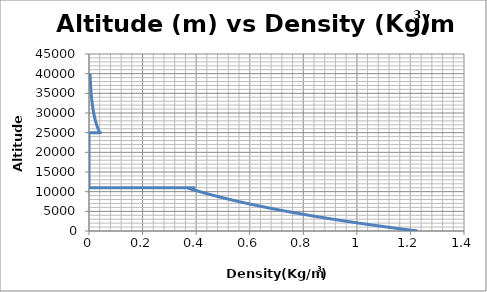
| Category | Series 0 |
|---|---|
| 1.22661378741097 | 0 |
| 1.225438372072172 | 10 |
| 1.2242638186305281 | 20 |
| 1.2230901266480423 | 30 |
| 1.221917295686837 | 40 |
| 1.2207453253091662 | 50 |
| 1.2195742150774005 | 60 |
| 1.218403964554039 | 70 |
| 1.2172345733017043 | 80 |
| 1.2160660408831405 | 90 |
| 1.214898366861219 | 100 |
| 1.213731550798931 | 110 |
| 1.2125655922593948 | 120 |
| 1.2114004908058522 | 130 |
| 1.2102362460016671 | 140 |
| 1.2090728574103307 | 150 |
| 1.2079103245954532 | 160 |
| 1.206748647120772 | 170 |
| 1.2055878245501488 | 180 |
| 1.2044278564475666 | 190 |
| 1.2032687423771353 | 200 |
| 1.2021104819030843 | 210 |
| 1.2009530745897703 | 220 |
| 1.1997965200016756 | 230 |
| 1.1986408177034003 | 240 |
| 1.197485967259674 | 250 |
| 1.196331968235345 | 260 |
| 1.1951788201953906 | 270 |
| 1.1940265227049098 | 280 |
| 1.1928750753291224 | 290 |
| 1.191724477633377 | 300 |
| 1.1905747291831406 | 310 |
| 1.1894258295440094 | 320 |
| 1.188277778281701 | 330 |
| 1.1871305749620542 | 340 |
| 1.1859842191510357 | 350 |
| 1.184838710414733 | 360 |
| 1.183694048319359 | 370 |
| 1.1825502324312502 | 380 |
| 1.1814072623168645 | 390 |
| 1.1802651375427866 | 400 |
| 1.1791238576757228 | 410 |
| 1.1779834222825052 | 420 |
| 1.176843830930086 | 430 |
| 1.1757050831855445 | 440 |
| 1.1745671786160825 | 450 |
| 1.1734301167890246 | 460 |
| 1.1722938972718204 | 470 |
| 1.1711585196320433 | 480 |
| 1.1700239834373865 | 490 |
| 1.168890288255674 | 500 |
| 1.1677574336548457 | 510 |
| 1.1666254192029712 | 520 |
| 1.1654942444682381 | 530 |
| 1.1643639090189637 | 540 |
| 1.1632344124235854 | 550 |
| 1.162105754250663 | 560 |
| 1.160977934068882 | 570 |
| 1.1598509514470514 | 580 |
| 1.158724805954103 | 590 |
| 1.1575994971590935 | 600 |
| 1.1564750246311999 | 610 |
| 1.1553513879397266 | 620 |
| 1.1542285866540987 | 630 |
| 1.1531066203438662 | 640 |
| 1.151985488578704 | 650 |
| 1.150865190928406 | 660 |
| 1.1497457269628943 | 670 |
| 1.1486270962522118 | 680 |
| 1.1475092983665258 | 690 |
| 1.1463923328761283 | 700 |
| 1.1452761993514313 | 710 |
| 1.1441608973629738 | 720 |
| 1.1430464264814162 | 730 |
| 1.141932786277543 | 740 |
| 1.1408199763222635 | 750 |
| 1.1397079961866061 | 760 |
| 1.138596845441729 | 770 |
| 1.1374865236589076 | 780 |
| 1.1363770304095446 | 790 |
| 1.1352683652651663 | 800 |
| 1.134160527797418 | 810 |
| 1.133053517578075 | 820 |
| 1.1319473341790296 | 830 |
| 1.1308419771723013 | 840 |
| 1.129737446130033 | 850 |
| 1.1286337406244882 | 860 |
| 1.1275308602280576 | 870 |
| 1.126428804513251 | 880 |
| 1.1253275730527044 | 890 |
| 1.124227165419177 | 900 |
| 1.12312758118555 | 910 |
| 1.12202881992483 | 920 |
| 1.1209308812101433 | 930 |
| 1.1198337646147427 | 940 |
| 1.1187374697120043 | 950 |
| 1.1176419960754254 | 960 |
| 1.1165473432786286 | 970 |
| 1.1154535108953576 | 980 |
| 1.1143604984994808 | 990 |
| 1.113268305664992 | 1000 |
| 1.1121769319660024 | 1010 |
| 1.1110863769767534 | 1020 |
| 1.1099966402716024 | 1030 |
| 1.1089077214250367 | 1040 |
| 1.1078196200116643 | 1050 |
| 1.1067323356062138 | 1060 |
| 1.1056458677835415 | 1070 |
| 1.1045602161186219 | 1080 |
| 1.1034753801865578 | 1090 |
| 1.102391359562573 | 1100 |
| 1.1013081538220122 | 1110 |
| 1.100225762540347 | 1120 |
| 1.0991441852931703 | 1130 |
| 1.0980634216561977 | 1140 |
| 1.0969834712052706 | 1150 |
| 1.0959043335163487 | 1160 |
| 1.09482600816552 | 1170 |
| 1.093748494728992 | 1180 |
| 1.092671792783097 | 1190 |
| 1.091595901904291 | 1200 |
| 1.0905208216691504 | 1210 |
| 1.089446551654378 | 1220 |
| 1.088373091436797 | 1230 |
| 1.0873004405933553 | 1240 |
| 1.0862285987011246 | 1250 |
| 1.085157565337296 | 1260 |
| 1.0840873400791886 | 1270 |
| 1.08301792250424 | 1280 |
| 1.081949312190014 | 1290 |
| 1.0808815087141963 | 1300 |
| 1.0798145116545952 | 1310 |
| 1.078748320589144 | 1320 |
| 1.0776829350958952 | 1330 |
| 1.076618354753028 | 1340 |
| 1.0755545791388434 | 1350 |
| 1.0744916078317643 | 1360 |
| 1.0734294404103393 | 1370 |
| 1.0723680764532355 | 1380 |
| 1.0713075155392473 | 1390 |
| 1.0702477572472908 | 1400 |
| 1.0691888011564035 | 1410 |
| 1.0681306468457488 | 1420 |
| 1.0670732938946088 | 1430 |
| 1.0660167418823927 | 1440 |
| 1.0649609903886303 | 1450 |
| 1.063906038992975 | 1460 |
| 1.0628518872752044 | 1470 |
| 1.061798534815215 | 1480 |
| 1.06074598119303 | 1490 |
| 1.0596942259887965 | 1500 |
| 1.058643268782779 | 1510 |
| 1.057593109155371 | 1520 |
| 1.056543746687083 | 1530 |
| 1.0554951809585542 | 1540 |
| 1.0544474115505438 | 1550 |
| 1.0534004380439317 | 1560 |
| 1.0523542600197255 | 1570 |
| 1.05130887705905 | 1580 |
| 1.0502642887431581 | 1590 |
| 1.0492204946534243 | 1600 |
| 1.0481774943713416 | 1610 |
| 1.0471352874785316 | 1620 |
| 1.0460938735567347 | 1630 |
| 1.0450532521878162 | 1640 |
| 1.0440134229537645 | 1650 |
| 1.0429743854366877 | 1660 |
| 1.0419361392188202 | 1670 |
| 1.0408986838825172 | 1680 |
| 1.039862019010258 | 1690 |
| 1.0388261441846425 | 1700 |
| 1.0377910589883954 | 1710 |
| 1.0367567630043633 | 1720 |
| 1.0357232558155152 | 1730 |
| 1.0346905370049437 | 1740 |
| 1.0336586061558646 | 1750 |
| 1.0326274628516126 | 1760 |
| 1.0315971066756513 | 1770 |
| 1.0305675372115608 | 1780 |
| 1.0295387540430492 | 1790 |
| 1.0285107567539418 | 1800 |
| 1.0274835449281916 | 1810 |
| 1.0264571181498725 | 1820 |
| 1.025431476003179 | 1830 |
| 1.0244066180724318 | 1840 |
| 1.0233825439420696 | 1850 |
| 1.022359253196659 | 1860 |
| 1.0213367454208873 | 1870 |
| 1.0203150201995614 | 1880 |
| 1.019294077117615 | 1890 |
| 1.0182739157601015 | 1900 |
| 1.0172545357121987 | 1910 |
| 1.016235936559207 | 1920 |
| 1.0152181178865471 | 1930 |
| 1.014201079279765 | 1940 |
| 1.0131848203245275 | 1950 |
| 1.0121693406066246 | 1960 |
| 1.0111546397119702 | 1970 |
| 1.010140717226597 | 1980 |
| 1.0091275727366642 | 1990 |
| 1.008115205828451 | 2000 |
| 1.0071036160883604 | 2010 |
| 1.0060928031029186 | 2020 |
| 1.005082766458771 | 2030 |
| 1.0040735057426897 | 2040 |
| 1.0030650205415659 | 2050 |
| 1.0020573104424153 | 2060 |
| 1.0010503750323758 | 2070 |
| 1.0000442138987065 | 2080 |
| 0.9990388266287914 | 2090 |
| 0.9980342128101332 | 2100 |
| 0.9970303720303607 | 2110 |
| 0.9960273038772235 | 2120 |
| 0.9950250079385935 | 2130 |
| 0.9940234838024666 | 2140 |
| 0.9930227310569578 | 2150 |
| 0.9920227492903075 | 2160 |
| 0.991023538090878 | 2170 |
| 0.9900250970471527 | 2180 |
| 0.9890274257477396 | 2190 |
| 0.9880305237813655 | 2200 |
| 0.9870343907368831 | 2210 |
| 0.9860390262032663 | 2220 |
| 0.9850444297696106 | 2230 |
| 0.9840506010251354 | 2240 |
| 0.98305753955918 | 2250 |
| 0.9820652449612072 | 2260 |
| 0.9810737168208052 | 2270 |
| 0.9800829547276788 | 2280 |
| 0.9790929582716599 | 2290 |
| 0.9781037270426983 | 2300 |
| 0.9771152606308712 | 2310 |
| 0.9761275586263755 | 2320 |
| 0.9751406206195284 | 2330 |
| 0.9741544462007731 | 2340 |
| 0.9731690349606718 | 2350 |
| 0.9721843864899115 | 2360 |
| 0.9712005003793011 | 2370 |
| 0.9702173762197691 | 2380 |
| 0.9692350136023695 | 2390 |
| 0.9682534121182766 | 2400 |
| 0.967272571358788 | 2410 |
| 0.9662924909153235 | 2420 |
| 0.9653131703794235 | 2430 |
| 0.9643346093427525 | 2440 |
| 0.9633568073970956 | 2450 |
| 0.9623797641343615 | 2460 |
| 0.9614034791465815 | 2470 |
| 0.9604279520259059 | 2480 |
| 0.959453182364611 | 2490 |
| 0.9584791697550923 | 2500 |
| 0.9575059137898696 | 2510 |
| 0.9565334140615845 | 2520 |
| 0.9555616701629976 | 2530 |
| 0.9545906816869977 | 2540 |
| 0.9536204482265893 | 2550 |
| 0.952650969374903 | 2560 |
| 0.9516822447251907 | 2570 |
| 0.9507142738708255 | 2580 |
| 0.9497470564053044 | 2590 |
| 0.9487805919222433 | 2600 |
| 0.9478148800153833 | 2610 |
| 0.9468499202785864 | 2620 |
| 0.9458857123058362 | 2630 |
| 0.9449222556912399 | 2640 |
| 0.9439595500290235 | 2650 |
| 0.9429975949135387 | 2660 |
| 0.9420363899392576 | 2670 |
| 0.9410759347007736 | 2680 |
| 0.9401162287928048 | 2690 |
| 0.939157271810187 | 2700 |
| 0.9381990633478812 | 2710 |
| 0.9372416030009703 | 2720 |
| 0.9362848903646576 | 2730 |
| 0.9353289250342703 | 2740 |
| 0.9343737066052552 | 2750 |
| 0.9334192346731823 | 2760 |
| 0.9324655088337457 | 2770 |
| 0.9315125286827571 | 2780 |
| 0.9305602938161541 | 2790 |
| 0.9296088038299919 | 2800 |
| 0.9286580583204523 | 2810 |
| 0.9277080568838377 | 2820 |
| 0.9267587991165693 | 2830 |
| 0.9258102846151944 | 2840 |
| 0.9248625129763791 | 2850 |
| 0.9239154837969139 | 2860 |
| 0.9229691966737084 | 2870 |
| 0.9220236512037961 | 2880 |
| 0.9210788469843326 | 2890 |
| 0.9201347836125932 | 2900 |
| 0.919191460685977 | 2910 |
| 0.9182488778020055 | 2920 |
| 0.9173070345583187 | 2930 |
| 0.9163659305526823 | 2940 |
| 0.9154255653829813 | 2950 |
| 0.9144859386472238 | 2960 |
| 0.9135470499435384 | 2970 |
| 0.9126088988701766 | 2980 |
| 0.9116714850255121 | 2990 |
| 0.9107348080080386 | 3000 |
| 0.9097988674163732 | 3010 |
| 0.9088636628492548 | 3020 |
| 0.9079291939055414 | 3030 |
| 0.9069954601842176 | 3040 |
| 0.9060624612843851 | 3050 |
| 0.9051301968052698 | 3060 |
| 0.904198666346217 | 3070 |
| 0.9032678695066974 | 3080 |
| 0.9023378058863019 | 3090 |
| 0.9014084750847402 | 3100 |
| 0.9004798767018477 | 3110 |
| 0.8995520103375797 | 3120 |
| 0.898624875592013 | 3130 |
| 0.8976984720653477 | 3140 |
| 0.8967727993579022 | 3150 |
| 0.8958478570701202 | 3160 |
| 0.8949236448025644 | 3170 |
| 0.8940001621559208 | 3180 |
| 0.8930774087309977 | 3190 |
| 0.8921553841287215 | 3200 |
| 0.8912340879501442 | 3210 |
| 0.8903135197964365 | 3220 |
| 0.8893936792688929 | 3230 |
| 0.888474565968929 | 3240 |
| 0.8875561794980797 | 3250 |
| 0.8866385194580046 | 3260 |
| 0.8857215854504831 | 3270 |
| 0.8848053770774166 | 3280 |
| 0.8838898939408293 | 3290 |
| 0.8829751356428631 | 3300 |
| 0.8820611017857872 | 3310 |
| 0.8811477919719871 | 3320 |
| 0.8802352058039722 | 3330 |
| 0.879323342884374 | 3340 |
| 0.8784122028159436 | 3350 |
| 0.8775017852015563 | 3360 |
| 0.8765920896442052 | 3370 |
| 0.875683115747008 | 3380 |
| 0.8747748631132032 | 3390 |
| 0.8738673313461498 | 3400 |
| 0.8729605200493299 | 3410 |
| 0.8720544288263444 | 3420 |
| 0.8711490572809181 | 3430 |
| 0.8702444050168968 | 3440 |
| 0.8693404716382467 | 3450 |
| 0.8684372567490575 | 3460 |
| 0.8675347599535369 | 3470 |
| 0.8666329808560169 | 3480 |
| 0.8657319190609507 | 3490 |
| 0.8648315741729115 | 3500 |
| 0.8639319457965953 | 3510 |
| 0.8630330335368175 | 3520 |
| 0.8621348369985167 | 3530 |
| 0.8612373557867539 | 3540 |
| 0.8603405895067079 | 3550 |
| 0.8594445377636826 | 3560 |
| 0.8585492001630992 | 3570 |
| 0.8576545763105045 | 3580 |
| 0.8567606658115648 | 3590 |
| 0.8558674682720662 | 3600 |
| 0.8549749832979187 | 3610 |
| 0.8540832104951512 | 3620 |
| 0.8531921494699162 | 3630 |
| 0.852301799828487 | 3640 |
| 0.8514121611772555 | 3650 |
| 0.8505232331227388 | 3660 |
| 0.8496350152715725 | 3670 |
| 0.8487475072305147 | 3680 |
| 0.8478607086064454 | 3690 |
| 0.8469746190063628 | 3700 |
| 0.8460892380373903 | 3710 |
| 0.8452045653067697 | 3720 |
| 0.8443206004218651 | 3730 |
| 0.8434373429901629 | 3740 |
| 0.8425547926192677 | 3750 |
| 0.8416729489169082 | 3760 |
| 0.8407918114909328 | 3770 |
| 0.8399113799493116 | 3780 |
| 0.8390316539001368 | 3790 |
| 0.8381526329516182 | 3800 |
| 0.8372743167120925 | 3810 |
| 0.8363967047900118 | 3820 |
| 0.8355197967939529 | 3830 |
| 0.8346435923326132 | 3840 |
| 0.8337680910148099 | 3850 |
| 0.8328932924494833 | 3860 |
| 0.8320191962456924 | 3870 |
| 0.8311458020126191 | 3880 |
| 0.8302731093595667 | 3890 |
| 0.8294011178959577 | 3900 |
| 0.8285298272313382 | 3910 |
| 0.827659236975372 | 3920 |
| 0.8267893467378474 | 3930 |
| 0.8259201561286723 | 3940 |
| 0.8250516647578751 | 3950 |
| 0.8241838722356066 | 3960 |
| 0.8233167781721367 | 3970 |
| 0.8224503821778582 | 3980 |
| 0.8215846838632843 | 3990 |
| 0.8207196828390487 | 4000 |
| 0.8198553787159079 | 4010 |
| 0.8189917711047359 | 4020 |
| 0.8181288596165304 | 4030 |
| 0.8172666438624117 | 4040 |
| 0.8164051234536162 | 4050 |
| 0.8155442980015057 | 4060 |
| 0.8146841671175593 | 4070 |
| 0.8138247304133807 | 4080 |
| 0.8129659875006933 | 4090 |
| 0.8121079379913392 | 4100 |
| 0.8112505814972844 | 4110 |
| 0.8103939176306139 | 4120 |
| 0.8095379460035356 | 4130 |
| 0.8086826662283756 | 4140 |
| 0.8078280779175827 | 4150 |
| 0.8069741806837272 | 4160 |
| 0.8061209741394981 | 4170 |
| 0.8052684578977073 | 4180 |
| 0.8044166315712871 | 4190 |
| 0.8035654947732892 | 4200 |
| 0.8027150471168882 | 4210 |
| 0.8018652882153784 | 4220 |
| 0.8010162176821759 | 4230 |
| 0.8001678351308154 | 4240 |
| 0.7993201401749547 | 4250 |
| 0.7984731324283721 | 4260 |
| 0.7976268115049658 | 4270 |
| 0.7967811770187553 | 4280 |
| 0.7959362285838819 | 4290 |
| 0.7950919658146045 | 4300 |
| 0.7942483883253075 | 4310 |
| 0.7934054957304916 | 4320 |
| 0.7925632876447815 | 4330 |
| 0.7917217636829192 | 4340 |
| 0.7908809234597717 | 4350 |
| 0.7900407665903247 | 4360 |
| 0.7892012926896829 | 4370 |
| 0.7883625013730743 | 4380 |
| 0.787524392255847 | 4390 |
| 0.786686964953469 | 4400 |
| 0.7858502190815303 | 4410 |
| 0.7850141542557393 | 4420 |
| 0.7841787700919277 | 4430 |
| 0.7833440662060465 | 4440 |
| 0.7825100422141672 | 4450 |
| 0.7816766977324838 | 4460 |
| 0.7808440323773077 | 4470 |
| 0.780012045765074 | 4480 |
| 0.7791807375123366 | 4490 |
| 0.778350107235771 | 4500 |
| 0.7775201545521736 | 4510 |
| 0.7766908790784592 | 4520 |
| 0.7758622804316664 | 4530 |
| 0.7750343582289517 | 4540 |
| 0.7742071120875936 | 4550 |
| 0.7733805416249921 | 4560 |
| 0.7725546464586641 | 4570 |
| 0.7717294262062523 | 4580 |
| 0.7709048804855151 | 4590 |
| 0.7700810089143342 | 4600 |
| 0.7692578111107117 | 4610 |
| 0.7684352866927691 | 4620 |
| 0.7676134352787499 | 4630 |
| 0.7667922564870163 | 4640 |
| 0.7659717499360521 | 4650 |
| 0.7651519152444624 | 4660 |
| 0.7643327520309711 | 4670 |
| 0.7635142599144242 | 4680 |
| 0.7626964385137861 | 4690 |
| 0.7618792874481438 | 4700 |
| 0.7610628063367041 | 4710 |
| 0.7602469947987937 | 4720 |
| 0.7594318524538611 | 4730 |
| 0.7586173789214729 | 4740 |
| 0.7578035738213175 | 4750 |
| 0.7569904367732057 | 4760 |
| 0.7561779673970647 | 4770 |
| 0.7553661653129459 | 4780 |
| 0.7545550301410177 | 4790 |
| 0.7537445615015709 | 4800 |
| 0.7529347590150182 | 4810 |
| 0.752125622301889 | 4820 |
| 0.7513171509828361 | 4830 |
| 0.7505093446786301 | 4840 |
| 0.7497022030101647 | 4850 |
| 0.7488957255984527 | 4860 |
| 0.7480899120646262 | 4870 |
| 0.7472847620299393 | 4880 |
| 0.7464802751157655 | 4890 |
| 0.7456764509435987 | 4900 |
| 0.7448732891350546 | 4910 |
| 0.7440707893118655 | 4920 |
| 0.7432689510958885 | 4930 |
| 0.742467774109098 | 4940 |
| 0.7416672579735891 | 4950 |
| 0.7408674023115793 | 4960 |
| 0.7400682067454026 | 4970 |
| 0.7392696708975165 | 4980 |
| 0.7384717943904976 | 4990 |
| 0.7376745768470427 | 5000 |
| 0.7368780178899687 | 5010 |
| 0.7360821171422127 | 5020 |
| 0.7352868742268325 | 5030 |
| 0.7344922887670063 | 5040 |
| 0.7336983603860315 | 5050 |
| 0.7329050887073266 | 5060 |
| 0.7321124733544285 | 5070 |
| 0.7313205139509982 | 5080 |
| 0.7305292101208127 | 5090 |
| 0.7297385614877714 | 5100 |
| 0.7289485676758926 | 5110 |
| 0.7281592283093161 | 5120 |
| 0.7273705430123015 | 5130 |
| 0.7265825114092281 | 5140 |
| 0.7257951331245948 | 5150 |
| 0.7250084077830214 | 5160 |
| 0.724222335009248 | 5170 |
| 0.7234369144281351 | 5180 |
| 0.7226521456646614 | 5190 |
| 0.7218680283439277 | 5200 |
| 0.7210845620911542 | 5210 |
| 0.7203017465316808 | 5220 |
| 0.7195195812909682 | 5230 |
| 0.7187380659945962 | 5240 |
| 0.7179572002682655 | 5250 |
| 0.7171769837377968 | 5260 |
| 0.7163974160291297 | 5270 |
| 0.7156184967683257 | 5280 |
| 0.7148402255815648 | 5290 |
| 0.714062602095147 | 5300 |
| 0.7132856259354938 | 5310 |
| 0.7125092967291448 | 5320 |
| 0.7117336141027614 | 5330 |
| 0.7109585776831229 | 5340 |
| 0.710184187097131 | 5350 |
| 0.7094104419718054 | 5360 |
| 0.7086373419342861 | 5370 |
| 0.7078648866118341 | 5380 |
| 0.7070930756318291 | 5390 |
| 0.7063219086217715 | 5400 |
| 0.7055513852092816 | 5410 |
| 0.7047815050220988 | 5420 |
| 0.704012267688083 | 5430 |
| 0.7032436728352148 | 5440 |
| 0.7024757200915934 | 5450 |
| 0.7017084090854383 | 5460 |
| 0.7009417394450889 | 5470 |
| 0.7001757107990045 | 5480 |
| 0.6994103227757641 | 5490 |
| 0.6986455750040673 | 5500 |
| 0.6978814671127329 | 5510 |
| 0.697117998730698 | 5520 |
| 0.6963551694870239 | 5530 |
| 0.6955929790108867 | 5540 |
| 0.6948314269315856 | 5550 |
| 0.6940705128785382 | 5560 |
| 0.6933102364812816 | 5570 |
| 0.6925505973694751 | 5580 |
| 0.6917915951728941 | 5590 |
| 0.691033229521437 | 5600 |
| 0.6902755000451197 | 5610 |
| 0.6895184063740798 | 5620 |
| 0.688761948138573 | 5630 |
| 0.6880061249689753 | 5640 |
| 0.6872509364957831 | 5650 |
| 0.6864963823496111 | 5660 |
| 0.6857424621611954 | 5670 |
| 0.6849891755613906 | 5680 |
| 0.6842365221811713 | 5690 |
| 0.6834845016516317 | 5700 |
| 0.6827331136039866 | 5710 |
| 0.6819823576695693 | 5720 |
| 0.6812322334798331 | 5730 |
| 0.680482740666351 | 5740 |
| 0.6797338788608154 | 5750 |
| 0.6789856476950397 | 5760 |
| 0.6782380468009552 | 5770 |
| 0.6774910758106137 | 5780 |
| 0.6767447343561859 | 5790 |
| 0.6759990220699631 | 5800 |
| 0.6752539385843561 | 5810 |
| 0.6745094835318949 | 5820 |
| 0.6737656565452287 | 5830 |
| 0.6730224572571263 | 5840 |
| 0.6722798853004777 | 5850 |
| 0.6715379403082908 | 5860 |
| 0.6707966219136934 | 5870 |
| 0.6700559297499328 | 5880 |
| 0.6693158634503761 | 5890 |
| 0.6685764226485104 | 5900 |
| 0.6678376069779411 | 5910 |
| 0.6670994160723946 | 5920 |
| 0.6663618495657149 | 5930 |
| 0.6656249070918672 | 5940 |
| 0.664888588284936 | 5950 |
| 0.6641528927791246 | 5960 |
| 0.6634178202087555 | 5970 |
| 0.6626833702082723 | 5980 |
| 0.6619495424122359 | 5990 |
| 0.6612163364553286 | 6000 |
| 0.6604837519723512 | 6010 |
| 0.6597517885982235 | 6020 |
| 0.6590204459679859 | 6030 |
| 0.6582897237167971 | 6040 |
| 0.6575596214799362 | 6050 |
| 0.6568301388928011 | 6060 |
| 0.6561012755909087 | 6070 |
| 0.6553730312098964 | 6080 |
| 0.65464540538552 | 6090 |
| 0.6539183977536558 | 6100 |
| 0.6531920079502976 | 6110 |
| 0.6524662356115607 | 6120 |
| 0.6517410803736784 | 6130 |
| 0.6510165418730033 | 6140 |
| 0.6502926197460085 | 6150 |
| 0.6495693136292847 | 6160 |
| 0.6488466231595439 | 6170 |
| 0.6481245479736157 | 6180 |
| 0.6474030877084497 | 6190 |
| 0.6466822420011147 | 6200 |
| 0.6459620104887998 | 6210 |
| 0.6452423928088115 | 6220 |
| 0.6445233885985768 | 6230 |
| 0.6438049974956412 | 6240 |
| 0.6430872191376706 | 6250 |
| 0.6423700531624493 | 6260 |
| 0.6416534992078814 | 6270 |
| 0.6409375569119891 | 6280 |
| 0.6402222259129144 | 6290 |
| 0.6395075058489198 | 6300 |
| 0.6387933963583854 | 6310 |
| 0.6380798970798109 | 6320 |
| 0.6373670076518153 | 6330 |
| 0.6366547277131359 | 6340 |
| 0.6359430569026319 | 6350 |
| 0.6352319948592785 | 6360 |
| 0.6345215412221719 | 6370 |
| 0.6338116956305263 | 6380 |
| 0.633102457723676 | 6390 |
| 0.6323938271410745 | 6400 |
| 0.631685803522294 | 6410 |
| 0.6309783865070254 | 6420 |
| 0.6302715757350789 | 6430 |
| 0.6295653708463844 | 6440 |
| 0.6288597714809911 | 6450 |
| 0.6281547772790664 | 6460 |
| 0.6274503878808964 | 6470 |
| 0.6267466029268881 | 6480 |
| 0.6260434220575655 | 6490 |
| 0.6253408449135733 | 6500 |
| 0.6246388711356746 | 6510 |
| 0.6239375003647506 | 6520 |
| 0.6232367322418035 | 6530 |
| 0.6225365664079525 | 6540 |
| 0.6218370025044379 | 6550 |
| 0.6211380401726164 | 6560 |
| 0.6204396790539667 | 6570 |
| 0.619741918790084 | 6580 |
| 0.6190447590226833 | 6590 |
| 0.6183481993935998 | 6600 |
| 0.6176522395447851 | 6610 |
| 0.6169568791183124 | 6620 |
| 0.6162621177563724 | 6630 |
| 0.6155679551012746 | 6640 |
| 0.6148743907954484 | 6650 |
| 0.6141814244814411 | 6660 |
| 0.6134890558019198 | 6670 |
| 0.6127972843996702 | 6680 |
| 0.6121061099175963 | 6690 |
| 0.6114155319987218 | 6700 |
| 0.610725550286189 | 6710 |
| 0.6100361644232597 | 6720 |
| 0.6093473740533129 | 6730 |
| 0.6086591788198478 | 6740 |
| 0.6079715783664823 | 6750 |
| 0.6072845723369531 | 6760 |
| 0.6065981603751156 | 6770 |
| 0.6059123421249442 | 6780 |
| 0.6052271172305309 | 6790 |
| 0.6045424853360897 | 6800 |
| 0.6038584460859494 | 6810 |
| 0.6031749991245606 | 6820 |
| 0.6024921440964913 | 6830 |
| 0.6018098806464276 | 6840 |
| 0.6011282084191772 | 6850 |
| 0.6004471270596633 | 6860 |
| 0.5997666362129299 | 6870 |
| 0.5990867355241387 | 6880 |
| 0.5984074246385711 | 6890 |
| 0.5977287032016262 | 6900 |
| 0.5970505708588225 | 6910 |
| 0.5963730272557971 | 6920 |
| 0.5956960720383051 | 6930 |
| 0.595019704852222 | 6940 |
| 0.5943439253435405 | 6950 |
| 0.5936687331583719 | 6960 |
| 0.592994127942947 | 6970 |
| 0.5923201093436155 | 6980 |
| 0.5916466770068447 | 6990 |
| 0.5909738305792209 | 7000 |
| 0.5903015697074494 | 7010 |
| 0.5896298940383536 | 7020 |
| 0.5889588032188768 | 7030 |
| 0.5882882968960793 | 7040 |
| 0.5876183747171408 | 7050 |
| 0.5869490363293587 | 7060 |
| 0.5862802813801513 | 7070 |
| 0.5856121095170533 | 7080 |
| 0.5849445203877186 | 7090 |
| 0.5842775136399195 | 7100 |
| 0.5836110889215468 | 7110 |
| 0.582945245880611 | 7120 |
| 0.5822799841652403 | 7130 |
| 0.5816153034236807 | 7140 |
| 0.5809512033042974 | 7150 |
| 0.5802876834555748 | 7160 |
| 0.579624743526115 | 7170 |
| 0.5789623831646389 | 7180 |
| 0.5783006020199855 | 7190 |
| 0.5776393997411122 | 7200 |
| 0.5769787759770957 | 7210 |
| 0.5763187303771309 | 7220 |
| 0.5756592625905311 | 7230 |
| 0.5750003722667271 | 7240 |
| 0.5743420590552698 | 7250 |
| 0.5736843226058271 | 7260 |
| 0.5730271625681868 | 7270 |
| 0.5723705785922537 | 7280 |
| 0.5717145703280512 | 7290 |
| 0.5710591374257223 | 7300 |
| 0.5704042795355271 | 7310 |
| 0.569749996307845 | 7320 |
| 0.5690962873931726 | 7330 |
| 0.5684431524421266 | 7340 |
| 0.5677905911054407 | 7350 |
| 0.5671386030339671 | 7360 |
| 0.5664871878786772 | 7370 |
| 0.5658363452906593 | 7380 |
| 0.5651860749211217 | 7390 |
| 0.5645363764213902 | 7400 |
| 0.5638872494429082 | 7410 |
| 0.5632386936372388 | 7420 |
| 0.5625907086560621 | 7430 |
| 0.5619432941511782 | 7440 |
| 0.5612964497745038 | 7450 |
| 0.5606501751780739 | 7460 |
| 0.5600044700140429 | 7470 |
| 0.5593593339346834 | 7480 |
| 0.5587147665923853 | 7490 |
| 0.5580707676396572 | 7500 |
| 0.5574273367291257 | 7510 |
| 0.5567844735135362 | 7520 |
| 0.5561421776457521 | 7530 |
| 0.5555004487787549 | 7540 |
| 0.5548592865656443 | 7550 |
| 0.554218690659637 | 7560 |
| 0.553578660714071 | 7570 |
| 0.5529391963823997 | 7580 |
| 0.5523002973181955 | 7590 |
| 0.5516619631751487 | 7600 |
| 0.5510241936070683 | 7610 |
| 0.5503869882678816 | 7620 |
| 0.5497503468116335 | 7630 |
| 0.5491142688924865 | 7640 |
| 0.5484787541647221 | 7650 |
| 0.5478438022827399 | 7660 |
| 0.5472094129010577 | 7670 |
| 0.5465755856743105 | 7680 |
| 0.5459423202572526 | 7690 |
| 0.5453096163047546 | 7700 |
| 0.5446774734718073 | 7710 |
| 0.5440458914135188 | 7720 |
| 0.5434148697851143 | 7730 |
| 0.5427844082419377 | 7740 |
| 0.542154506439452 | 7750 |
| 0.5415251640332359 | 7760 |
| 0.5408963806789887 | 7770 |
| 0.5402681560325259 | 7780 |
| 0.5396404897497812 | 7790 |
| 0.5390133814868074 | 7800 |
| 0.5383868308997742 | 7810 |
| 0.53776083764497 | 7820 |
| 0.5371354013788 | 7830 |
| 0.5365105217577889 | 7840 |
| 0.5358861984385788 | 7850 |
| 0.5352624310779288 | 7860 |
| 0.5346392193327173 | 7870 |
| 0.5340165628599398 | 7880 |
| 0.5333944613167101 | 7890 |
| 0.5327729143602601 | 7900 |
| 0.5321519216479382 | 7910 |
| 0.5315314828372131 | 7920 |
| 0.5309115975856692 | 7930 |
| 0.5302922655510102 | 7940 |
| 0.5296734863910568 | 7950 |
| 0.5290552597637477 | 7960 |
| 0.5284375853271401 | 7970 |
| 0.5278204627394085 | 7980 |
| 0.5272038916588454 | 7990 |
| 0.526587871743861 | 8000 |
| 0.5259724026529827 | 8010 |
| 0.5253574840448576 | 8020 |
| 0.5247431155782482 | 8030 |
| 0.5241292969120371 | 8040 |
| 0.5235160277052231 | 8050 |
| 0.5229033076169227 | 8060 |
| 0.522291136306372 | 8070 |
| 0.5216795134329227 | 8080 |
| 0.5210684386560456 | 8090 |
| 0.5204579116353285 | 8100 |
| 0.5198479320304771 | 8110 |
| 0.5192384995013161 | 8120 |
| 0.5186296137077852 | 8130 |
| 0.5180212743099446 | 8140 |
| 0.5174134809679704 | 8150 |
| 0.5168062333421575 | 8160 |
| 0.5161995310929179 | 8170 |
| 0.5155933738807807 | 8180 |
| 0.5149877613663945 | 8190 |
| 0.5143826932105237 | 8200 |
| 0.5137781690740514 | 8210 |
| 0.5131741886179781 | 8220 |
| 0.5125707515034215 | 8230 |
| 0.5119678573916172 | 8240 |
| 0.5113655059439195 | 8250 |
| 0.5107636968217987 | 8260 |
| 0.5101624296868434 | 8270 |
| 0.5095617042007594 | 8280 |
| 0.5089615200253708 | 8290 |
| 0.5083618768226192 | 8300 |
| 0.5077627742545634 | 8310 |
| 0.5071642119833795 | 8320 |
| 0.5065661896713611 | 8330 |
| 0.5059687069809212 | 8340 |
| 0.505371763574588 | 8350 |
| 0.5047753591150084 | 8360 |
| 0.5041794932649458 | 8370 |
| 0.5035841656872828 | 8380 |
| 0.5029893760450185 | 8390 |
| 0.5023951240012694 | 8400 |
| 0.5018014092192695 | 8410 |
| 0.5012082313623704 | 8420 |
| 0.5006155900940416 | 8430 |
| 0.5000234850778696 | 8440 |
| 0.49943191597755865 | 8450 |
| 0.49884088245692965 | 8460 |
| 0.4982503841799217 | 8470 |
| 0.4976604208105915 | 8480 |
| 0.49707099201311294 | 8490 |
| 0.4964820974517767 | 8500 |
| 0.4958937367909916 | 8510 |
| 0.49530590969528393 | 8520 |
| 0.4947186158292967 | 8530 |
| 0.49413185485779104 | 8540 |
| 0.49354562644564504 | 8550 |
| 0.4929599302578537 | 8560 |
| 0.49237476595953056 | 8570 |
| 0.4917901332159053 | 8580 |
| 0.4912060316923262 | 8590 |
| 0.4906224610542573 | 8600 |
| 0.49003942096728176 | 8610 |
| 0.4894569110970984 | 8620 |
| 0.4888749311095239 | 8630 |
| 0.488293480670493 | 8640 |
| 0.4877125594460567 | 8650 |
| 0.48713216710238405 | 8660 |
| 0.48655230330576077 | 8670 |
| 0.48597296772258997 | 8680 |
| 0.48539416001939256 | 8690 |
| 0.48481587986280555 | 8700 |
| 0.48423812691958495 | 8710 |
| 0.4836609008566024 | 8720 |
| 0.483084201340847 | 8730 |
| 0.48250802803942544 | 8740 |
| 0.4819323806195626 | 8750 |
| 0.4813572587485987 | 8760 |
| 0.48078266209399184 | 8770 |
| 0.4802085903233174 | 8780 |
| 0.4796350431042683 | 8790 |
| 0.4790620201046545 | 8800 |
| 0.47848952099240244 | 8810 |
| 0.4779175454355563 | 8820 |
| 0.4773460931022768 | 8830 |
| 0.47677516366084316 | 8840 |
| 0.47620475677965046 | 8850 |
| 0.47563487212721123 | 8860 |
| 0.47506550937215436 | 8870 |
| 0.4744966681832277 | 8880 |
| 0.47392834822929475 | 8890 |
| 0.47336054917933634 | 8900 |
| 0.47279327070245036 | 8910 |
| 0.4722265124678516 | 8920 |
| 0.4716602741448724 | 8930 |
| 0.4710945554029624 | 8940 |
| 0.47052935591168715 | 8950 |
| 0.46996467534073005 | 8960 |
| 0.46940051335989097 | 8970 |
| 0.46883686963908755 | 8980 |
| 0.4682737438483542 | 8990 |
| 0.4677111356578419 | 9000 |
| 0.46714904473781826 | 9010 |
| 0.46658747075866963 | 9020 |
| 0.4660264133908972 | 9030 |
| 0.46546587230512076 | 9040 |
| 0.46490584717207595 | 9050 |
| 0.4643463376626157 | 9060 |
| 0.46378734344771055 | 9070 |
| 0.4632288641984466 | 9080 |
| 0.4626708995860283 | 9090 |
| 0.46211344928177583 | 9100 |
| 0.4615565129571274 | 9110 |
| 0.46100009028363687 | 9120 |
| 0.46044418093297573 | 9130 |
| 0.45988878457693283 | 9140 |
| 0.4593339008874125 | 9150 |
| 0.458779529536437 | 9160 |
| 0.45822567019614563 | 9170 |
| 0.45767232253879325 | 9180 |
| 0.4571194862367526 | 9190 |
| 0.4565671609625136 | 9200 |
| 0.45601534638868185 | 9210 |
| 0.45546404218798037 | 9220 |
| 0.45491324803324873 | 9230 |
| 0.4543629635974437 | 9240 |
| 0.4538131885536388 | 9250 |
| 0.45326392257502385 | 9260 |
| 0.45271516533490586 | 9270 |
| 0.4521669165067079 | 9280 |
| 0.4516191757639711 | 9290 |
| 0.4510719427803519 | 9300 |
| 0.4505252172296249 | 9310 |
| 0.44997899878567993 | 9320 |
| 0.4494332871225244 | 9330 |
| 0.44888808191428303 | 9340 |
| 0.4483433828351952 | 9350 |
| 0.44779918955961934 | 9360 |
| 0.4472555017620289 | 9370 |
| 0.44671231911701476 | 9380 |
| 0.4461696412992848 | 9390 |
| 0.4456274679836621 | 9400 |
| 0.44508579884508814 | 9410 |
| 0.4445446335586195 | 9420 |
| 0.44400397179943085 | 9430 |
| 0.4434638132428124 | 9440 |
| 0.44292415756417114 | 9450 |
| 0.4423850044390311 | 9460 |
| 0.4418463535430325 | 9470 |
| 0.4413082045519327 | 9480 |
| 0.4407705571416047 | 9490 |
| 0.44023341098803864 | 9500 |
| 0.4396967657673414 | 9510 |
| 0.43916062115573634 | 9520 |
| 0.43862497682956314 | 9530 |
| 0.4380898324652779 | 9540 |
| 0.4375551877394532 | 9550 |
| 0.4370210423287787 | 9560 |
| 0.43648739591006047 | 9570 |
| 0.4359542481602207 | 9580 |
| 0.4354215987562978 | 9590 |
| 0.43488944737544716 | 9600 |
| 0.4343577936949413 | 9610 |
| 0.43382663739216815 | 9620 |
| 0.433295978144632 | 9630 |
| 0.43276581562995414 | 9640 |
| 0.4322361495258724 | 9650 |
| 0.43170697951024106 | 9660 |
| 0.43117830526103 | 9670 |
| 0.4306501264563267 | 9680 |
| 0.43012244277433365 | 9690 |
| 0.429595253893371 | 9700 |
| 0.4290685594918751 | 9710 |
| 0.42854235924839823 | 9720 |
| 0.42801665284160884 | 9730 |
| 0.4274914399502921 | 9740 |
| 0.42696672025335003 | 9750 |
| 0.42644249342980045 | 9760 |
| 0.42591875915877725 | 9770 |
| 0.425395517119531 | 9780 |
| 0.4248727669914291 | 9790 |
| 0.42435050845395406 | 9800 |
| 0.4238287411867057 | 9810 |
| 0.4233074648694001 | 9820 |
| 0.4227866791818684 | 9830 |
| 0.4222663838040598 | 9840 |
| 0.42174657841603863 | 9850 |
| 0.42122726269798594 | 9860 |
| 0.4207084363301984 | 9870 |
| 0.4201900989930898 | 9880 |
| 0.41967225036718975 | 9890 |
| 0.41915489013314355 | 9900 |
| 0.41863801797171385 | 9910 |
| 0.4181216335637786 | 9920 |
| 0.41760573659033234 | 9930 |
| 0.41709032673248586 | 9940 |
| 0.41657540367146534 | 9950 |
| 0.41606096708861445 | 9960 |
| 0.41554701666539223 | 9970 |
| 0.41503355208337406 | 9980 |
| 0.41452057302425127 | 9990 |
| 0.41400807916983107 | 10000 |
| 0.4134960702020376 | 10010 |
| 0.41298454580291116 | 10020 |
| 0.4124735056546071 | 10030 |
| 0.4119629494393976 | 10040 |
| 0.4114528768396707 | 10050 |
| 0.4109432875379308 | 10060 |
| 0.41043418121679853 | 10070 |
| 0.4099255575590102 | 10080 |
| 0.40941741624741795 | 10090 |
| 0.4089097569649901 | 10100 |
| 0.40840257939481206 | 10110 |
| 0.4078958832200841 | 10120 |
| 0.40738966812412264 | 10130 |
| 0.40688393379036003 | 10140 |
| 0.40637867990234555 | 10150 |
| 0.40587390614374363 | 10160 |
| 0.40536961219833517 | 10170 |
| 0.40486579775001635 | 10180 |
| 0.40436246248279967 | 10190 |
| 0.4038596060808141 | 10200 |
| 0.4033572282283044 | 10210 |
| 0.4028553286096305 | 10220 |
| 0.4023539069092692 | 10230 |
| 0.4018529628118123 | 10240 |
| 0.40135249600196865 | 10250 |
| 0.4008525061645624 | 10260 |
| 0.40035299298453353 | 10270 |
| 0.3998539561469376 | 10280 |
| 0.3993553953369473 | 10290 |
| 0.39885731023984994 | 10300 |
| 0.3983597005410488 | 10310 |
| 0.39786256592606417 | 10320 |
| 0.3973659060805306 | 10330 |
| 0.39686972069019993 | 10340 |
| 0.39637400944093887 | 10350 |
| 0.3958787720187301 | 10360 |
| 0.3953840081096724 | 10370 |
| 0.3948897173999805 | 10380 |
| 0.39439589957598475 | 10390 |
| 0.3939025543241308 | 10400 |
| 0.3934096813309805 | 10410 |
| 0.39291728028321155 | 10420 |
| 0.3924253508676178 | 10430 |
| 0.39193389277110807 | 10440 |
| 0.39144290568070716 | 10450 |
| 0.39095238928355525 | 10460 |
| 0.3904623432669099 | 10470 |
| 0.3899727673181427 | 10480 |
| 0.38948366112474103 | 10490 |
| 0.3889950243743089 | 10500 |
| 0.3885068567545646 | 10510 |
| 0.3880191579533444 | 10520 |
| 0.3875319276585982 | 10530 |
| 0.3870451655583922 | 10540 |
| 0.3865588713409079 | 10550 |
| 0.3860730446944437 | 10560 |
| 0.38558768530741255 | 10570 |
| 0.38510279286834304 | 10580 |
| 0.3846183670658799 | 10590 |
| 0.38413440758878264 | 10600 |
| 0.38365091412592756 | 10610 |
| 0.3831678863663059 | 10620 |
| 0.38268532399902455 | 10630 |
| 0.3822032267133054 | 10640 |
| 0.3817215941984873 | 10650 |
| 0.38124042614402315 | 10660 |
| 0.3807597222394828 | 10670 |
| 0.3802794821745503 | 10680 |
| 0.37979970563902615 | 10690 |
| 0.3793203923228263 | 10700 |
| 0.3788415419159818 | 10710 |
| 0.37836315410863974 | 10720 |
| 0.377885228591062 | 10730 |
| 0.3774077650536268 | 10740 |
| 0.3769307631868273 | 10750 |
| 0.3764542226812721 | 10760 |
| 0.3759781432276857 | 10770 |
| 0.37550252451690747 | 10780 |
| 0.37502736623989297 | 10790 |
| 0.37455266808771276 | 10800 |
| 0.3740784297515523 | 10810 |
| 0.37360465092271367 | 10820 |
| 0.37313133129261317 | 10830 |
| 0.3726584705527839 | 10840 |
| 0.37218606839487284 | 10850 |
| 0.3717141245106429 | 10860 |
| 0.37124263859197293 | 10870 |
| 0.37077161033085704 | 10880 |
| 0.3703010394194039 | 10890 |
| 0.3698309255498381 | 10900 |
| 0.36936126841449946 | 10910 |
| 0.3688920677058433 | 10920 |
| 0.3684233231164403 | 10930 |
| 0.3679550343389762 | 10940 |
| 0.36748720106625216 | 10950 |
| 0.3670198229911843 | 10960 |
| 0.3665528998068049 | 10970 |
| 0.366086431206261 | 10980 |
| 0.3656204168828147 | 10990 |
| 0.36515485652984336 | 11000 |
| 6.395055810185602e-08 | 11010 |
| 6.295437484060778e-08 | 11020 |
| 6.197370952196179e-08 | 11030 |
| 6.100832041675815e-08 | 11040 |
| 6.00579695613482e-08 | 11050 |
| 5.912242269893825e-08 | 11060 |
| 5.820144922184514e-08 | 11070 |
| 5.729482211465329e-08 | 11080 |
| 5.640231789825705e-08 | 11090 |
| 5.5523716574773037e-08 | 11100 |
| 5.465880157331253e-08 | 11110 |
| 5.3807359696597426e-08 | 11120 |
| 5.296918106840896e-08 | 11130 |
| 5.214405908185304e-08 | 11140 |
| 5.1331790348433295e-08 | 11150 |
| 5.053217464791736e-08 | 11160 |
| 4.974501487898244e-08 | 11170 |
| 4.89701170106316e-08 | 11180 |
| 4.8207290034365665e-08 | 11190 |
| 4.745634591710128e-08 | 11200 |
| 4.6717099554820685e-08 | 11210 |
| 4.5989368726944944e-08 | 11220 |
| 4.527297405141802e-08 | 11230 |
| 4.4567738940488966e-08 | 11240 |
| 4.387348955718441e-08 | 11250 |
| 4.319005477245909e-08 | 11260 |
| 4.2517266123012426e-08 | 11270 |
| 4.1854957769763786e-08 | 11280 |
| 4.120296645697367e-08 | 11290 |
| 4.0561131472002546e-08 | 11300 |
| 3.992929460569511e-08 | 11310 |
| 3.930730011338296e-08 | 11320 |
| 3.8694994676494717e-08 | 11330 |
| 3.809222736476291e-08 | 11340 |
| 3.749884959902083e-08 | 11350 |
| 3.6914715114578916e-08 | 11360 |
| 3.633967992517038e-08 | 11370 |
| 3.577360228745991e-08 | 11380 |
| 3.5216342666104326e-08 | 11390 |
| 3.4667763699358315e-08 | 11400 |
| 3.41277301652147e-08 | 11410 |
| 3.359610894807327e-08 | 11420 |
| 3.307276900592875e-08 | 11430 |
| 3.2557581338068956e-08 | 11440 |
| 3.205041895327703e-08 | 11450 |
| 3.1551156838529146e-08 | 11460 |
| 3.1059671928178676e-08 | 11470 |
| 3.057584307362161e-08 | 11480 |
| 3.009955101343378e-08 | 11490 |
| 2.963067834397396e-08 | 11500 |
| 2.9169109490443753e-08 | 11510 |
| 2.871473067839937e-08 | 11520 |
| 2.8267429905707037e-08 | 11530 |
| 2.7827096914934453e-08 | 11540 |
| 2.739362316617314e-08 | 11550 |
| 2.6966901810284222e-08 | 11560 |
| 2.6546827662560028e-08 | 11570 |
| 2.613329717679699e-08 | 11580 |
| 2.5726208419771822e-08 | 11590 |
| 2.5325461046115827e-08 | 11600 |
| 2.4930956273579733e-08 | 11610 |
| 2.454259685868464e-08 | 11620 |
| 2.416028707275222e-08 | 11630 |
| 2.3783932678307562e-08 | 11640 |
| 2.3413440905850343e-08 | 11650 |
| 2.30487204309879e-08 | 11660 |
| 2.2689681351923652e-08 | 11670 |
| 2.233623516729714e-08 | 11680 |
| 2.1988294754368677e-08 | 11690 |
| 2.1645774347544373e-08 | 11700 |
| 2.1308589517234823e-08 | 11710 |
| 2.097665714904393e-08 | 11720 |
| 2.064989542328177e-08 | 11730 |
| 2.0328223794796045e-08 | 11740 |
| 2.0011562973118308e-08 | 11750 |
| 1.9699834902919464e-08 | 11760 |
| 1.9392962744769086e-08 | 11770 |
| 1.909087085619518e-08 | 11780 |
| 1.8793484773038522e-08 | 11790 |
| 1.85007311910979e-08 | 11800 |
| 1.8212537948060582e-08 | 11810 |
| 1.7928834005714856e-08 | 11820 |
| 1.7649549432439666e-08 | 11830 |
| 1.7374615385966423e-08 | 11840 |
| 1.710396409640992e-08 | 11850 |
| 1.683752884956356e-08 | 11860 |
| 1.6575243970454293e-08 | 11870 |
| 1.6317044807154276e-08 | 11880 |
| 1.6062867714844384e-08 | 11890 |
| 1.5812650040126325e-08 | 11900 |
| 1.5566330105578496e-08 | 11910 |
| 1.5323847194553022e-08 | 11920 |
| 1.5085141536209553e-08 | 11930 |
| 1.4850154290781703e-08 | 11940 |
| 1.4618827535073516e-08 | 11950 |
| 1.4391104248181843e-08 | 11960 |
| 1.4166928297440644e-08 | 11970 |
| 1.3946244424584792e-08 | 11980 |
| 1.3728998232129051e-08 | 11990 |
| 1.35151361699596e-08 | 12000 |
| 1.3304605522133862e-08 | 12010 |
| 1.3097354393886464e-08 | 12020 |
| 1.2893331698837553e-08 | 12030 |
| 1.2692487146399982e-08 | 12040 |
| 1.2494771229383069e-08 | 12050 |
| 1.2300135211789452e-08 | 12060 |
| 1.2108531116801637e-08 | 12070 |
| 1.1919911714956129e-08 | 12080 |
| 1.1734230512501523e-08 | 12090 |
| 1.1551441739938171e-08 | 12100 |
| 1.1371500340735999e-08 | 12110 |
| 1.1194361960228404e-08 | 12120 |
| 1.1019982934679177e-08 | 12130 |
| 1.0848320280519362e-08 | 12140 |
| 1.0679331683752145e-08 | 12150 |
| 1.051297548952277e-08 | 12160 |
| 1.0349210691850595e-08 | 12170 |
| 1.0187996923521479e-08 | 12180 |
| 1.0029294446137376e-08 | 12190 |
| 9.873064140321178e-09 | 12200 |
| 9.719267496073746e-09 | 12210 |
| 9.567866603281512e-09 | 12220 |
| 9.418824142371915e-09 | 12230 |
| 9.272103375114106e-09 | 12240 |
| 9.127668135563261e-09 | 12250 |
| 8.985482821145952e-09 | 12260 |
| 8.845512383884085e-09 | 12270 |
| 8.707722321755896e-09 | 12280 |
| 8.572078670191284e-09 | 12290 |
| 8.438547993699849e-09 | 12300 |
| 8.30709737762903e-09 | 12310 |
| 8.177694420050887e-09 | 12320 |
| 8.050307223775278e-09 | 12330 |
| 7.924904388487184e-09 | 12340 |
| 7.801455003006771e-09 | 12350 |
| 7.679928637670027e-09 | 12360 |
| 7.560295336827826e-09 | 12370 |
| 7.4425256114621195e-09 | 12380 |
| 7.326590431916993e-09 | 12390 |
| 7.212461220743093e-09 | 12400 |
| 7.10010984565328e-09 | 12410 |
| 6.989508612588228e-09 | 12420 |
| 6.880630258890059e-09 | 12430 |
| 6.77344794658208e-09 | 12440 |
| 6.667935255753447e-09 | 12450 |
| 6.564066178046746e-09 | 12460 |
| 6.46181511024716e-09 | 12470 |
| 6.361156847971247e-09 | 12480 |
| 6.26206657945427e-09 | 12490 |
| 6.164519879434277e-09 | 12500 |
| 6.068492703131266e-09 | 12510 |
| 5.973961380320325e-09 | 12520 |
| 5.880902609497114e-09 | 12530 |
| 5.789293452134018e-09 | 12540 |
| 5.69911132702601e-09 | 12550 |
| 5.610334004724444e-09 | 12560 |
| 5.522939602057695e-09 | 12570 |
| 5.4369065767369376e-09 | 12580 |
| 5.352213722046143e-09 | 12590 |
| 5.268840161614783e-09 | 12600 |
| 5.186765344271798e-09 | 12610 |
| 5.105969038979882e-09 | 12620 |
| 5.026431329848698e-09 | 12630 |
| 4.948132611225594e-09 | 12640 |
| 4.871053582862973e-09 | 12650 |
| 4.795175245160859e-09 | 12660 |
| 4.720478894483642e-09 | 12670 |
| 4.646946118549626e-09 | 12680 |
| 4.574558791892548e-09 | 12690 |
| 4.503299071393784e-09 | 12700 |
| 4.4331493918840136e-09 | 12710 |
| 4.3640924618135395e-09 | 12720 |
| 4.296111258990057e-09 | 12730 |
| 4.229189026382665e-09 | 12740 |
| 4.163309267991411e-09 | 12750 |
| 4.098455744781075e-09 | 12760 |
| 4.034612470678388e-09 | 12770 |
| 3.971763708631453e-09 | 12780 |
| 3.909893966730686e-09 | 12790 |
| 3.848987994390178e-09 | 12800 |
| 3.789030778588418e-09 | 12810 |
| 3.730007540167696e-09 | 12820 |
| 3.671903730191157e-09 | 12830 |
| 3.614705026356477e-09 | 12840 |
| 3.558397329465544e-09 | 12850 |
| 3.502966759949043e-09 | 12860 |
| 3.4483996544452662e-09 | 12870 |
| 3.3946825624320842e-09 | 12880 |
| 3.3418022429114965e-09 | 12890 |
| 3.289745661145827e-09 | 12900 |
| 3.238499985444654e-09 | 12910 |
| 3.188052584001899e-09 | 12920 |
| 3.138391021782179e-09 | 12930 |
| 3.0895030574555686e-09 | 12940 |
| 3.0413766403802115e-09 | 12950 |
| 2.9939999076318824e-09 | 12960 |
| 2.947361181079872e-09 | 12970 |
| 2.9014489645083218e-09 | 12980 |
| 2.856251940782499e-09 | 12990 |
| 2.811758969059207e-09 | 13000 |
| 2.7679590820405603e-09 | 13010 |
| 2.7248414832706323e-09 | 13020 |
| 2.682395544474211e-09 | 13030 |
| 2.6406108029369216e-09 | 13040 |
| 2.5994769589262616e-09 | 13050 |
| 2.558983873152744e-09 | 13060 |
| 2.5191215642706526e-09 | 13070 |
| 2.479880206417632e-09 | 13080 |
| 2.4412501267926928e-09 | 13090 |
| 2.403221803271934e-09 | 13100 |
| 2.3657858620613404e-09 | 13110 |
| 2.32893307538621e-09 | 13120 |
| 2.292654359216582e-09 | 13130 |
| 2.2569407710280136e-09 | 13140 |
| 2.221783507597329e-09 | 13150 |
| 2.1871739028326507e-09 | 13160 |
| 2.153103425637283e-09 | 13170 |
| 2.1195636778067893e-09 | 13180 |
| 2.0865463919589025e-09 | 13190 |
| 2.054043429495678e-09 | 13200 |
| 2.0220467785973236e-09 | 13210 |
| 1.990548552247348e-09 | 13220 |
| 1.9595409862884713e-09 | 13230 |
| 1.9290164375087585e-09 | 13240 |
| 1.8989673817576298e-09 | 13250 |
| 1.8693864120911835e-09 | 13260 |
| 1.840266236946447e-09 | 13270 |
| 1.8115996783440025e-09 | 13280 |
| 1.7833796701186703e-09 | 13290 |
| 1.7555992561777537e-09 | 13300 |
| 1.7282515887863577e-09 | 13310 |
| 1.701329926879475e-09 | 13320 |
| 1.6748276344003664e-09 | 13330 |
| 1.6487381786647673e-09 | 13340 |
| 1.6230551287506384e-09 | 13350 |
| 1.597772153912964e-09 | 13360 |
| 1.5728830220232758e-09 | 13370 |
| 1.5483815980334315e-09 | 13380 |
| 1.5242618424633716e-09 | 13390 |
| 1.500517809912435e-09 | 13400 |
| 1.4771436475938127e-09 | 13410 |
| 1.4541335938918826e-09 | 13420 |
| 1.4314819769420153e-09 | 13430 |
| 1.409183213232454e-09 | 13440 |
| 1.3872318062280312e-09 | 13450 |
| 1.3656223450152856e-09 | 13460 |
| 1.3443495029687203e-09 | 13470 |
| 1.3234080364377875e-09 | 13480 |
| 1.3027927834543666e-09 | 13490 |
| 1.2824986624603818e-09 | 13500 |
| 1.262520671055192e-09 | 13510 |
| 1.2428538847625393e-09 | 13520 |
| 1.2234934558167042e-09 | 13530 |
| 1.204434611967526e-09 | 13540 |
| 1.1856726553040865e-09 | 13550 |
| 1.1672029610966895e-09 | 13560 |
| 1.1490209766569029e-09 | 13570 |
| 1.1311222202153197e-09 | 13580 |
| 1.1135022798168367e-09 | 13590 |
| 1.0961568122331407e-09 | 13600 |
| 1.0790815418921e-09 | 13610 |
| 1.06227225982387e-09 | 13620 |
| 1.045724822623413e-09 | 13630 |
| 1.029435151429148e-09 | 13640 |
| 1.0133992309175448e-09 | 13650 |
| 9.97613108313361e-10 | 13660 |
| 9.820728924153154e-10 | 13670 |
| 9.667747526369052e-10 | 13680 |
| 9.51714918062196e-10 | 13690 |
| 9.368896765163202e-10 | 13700 |
| 9.222953736504236e-10 | 13710 |
| 9.079284120408992e-10 | 13720 |
| 8.937852503026349e-10 | 13730 |
| 8.798624022160909e-10 | 13740 |
| 8.66156435867946e-10 | 13750 |
| 8.526639728051565e-10 | 13760 |
| 8.393816872021939e-10 | 13770 |
| 8.263063050412263e-10 | 13780 |
| 8.134346033050994e-10 | 13790 |
| 8.00763409182887e-10 | 13800 |
| 7.882895992877905e-10 | 13810 |
| 7.760100988872522e-10 | 13820 |
| 7.639218811450426e-10 | 13830 |
| 7.520219663751716e-10 | 13840 |
| 7.403074213073936e-10 | 13850 |
| 7.287753583641796e-10 | 13860 |
| 7.174229349489516e-10 | 13870 |
| 7.062473527453803e-10 | 13880 |
| 6.95245857027622e-10 | 13890 |
| 6.844157359813002e-10 | 13900 |
| 6.73754320035041e-10 | 13910 |
| 6.632589812024476e-10 | 13920 |
| 6.529271324343091e-10 | 13930 |
| 6.427562269809158e-10 | 13940 |
| 6.327437577642832e-10 | 13950 |
| 6.228872567601773e-10 | 13960 |
| 6.131842943897649e-10 | 13970 |
| 6.036324789207219e-10 | 13980 |
| 5.942294558776885e-10 | 13990 |
| 5.849729074619105e-10 | 14000 |
| 5.758605519798992e-10 | 14010 |
| 5.668901432810147e-10 | 14020 |
| 5.580594702037962e-10 | 14030 |
| 5.493663560309299e-10 | 14040 |
| 5.40808657952687e-10 | 14050 |
| 5.323842665387369e-10 | 14060 |
| 5.240911052181903e-10 | 14070 |
| 5.159271297677217e-10 | 14080 |
| 5.078903278076849e-10 | 14090 |
| 4.99978718306077e-10 | 14100 |
| 4.921903510902123e-10 | 14110 |
| 4.845233063660221e-10 | 14120 |
| 4.769756942448316e-10 | 14130 |
| 4.695456542775174e-10 | 14140 |
| 4.622313549959067e-10 | 14150 |
| 4.5503099346133484e-10 | 14160 |
| 4.479427948202338e-10 | 14170 |
| 4.409650118666303e-10 | 14180 |
| 4.340959246114728e-10 | 14190 |
| 4.2733383985866793e-10 | 14200 |
| 4.2067709078770585e-10 | 14210 |
| 4.141240365428039e-10 | 14220 |
| 4.0767306182844075e-10 | 14230 |
| 4.0132257651119954e-10 | 14240 |
| 3.950710152277997e-10 | 14250 |
| 3.889168369992464e-10 | 14260 |
| 3.8285852485099133e-10 | 14270 |
| 3.7689458543899755e-10 | 14280 |
| 3.7102354868164173e-10 | 14290 |
| 3.652439673973502e-10 | 14300 |
| 3.5955441694786805e-10 | 14310 |
| 3.539534948870978e-10 | 14320 |
| 3.4843982061540135e-10 | 14330 |
| 3.4301203503929315e-10 | 14340 |
| 3.3766880023642385e-10 | 14350 |
| 3.3240879912579197e-10 | 14360 |
| 3.2723073514309385e-10 | 14370 |
| 3.2213333192111994e-10 | 14380 |
| 3.171153329751401e-10 | 14390 |
| 3.1217550139318946e-10 | 14400 |
| 3.07312619531169e-10 | 14410 |
| 3.0252548871270726e-10 | 14420 |
| 2.9781292893368964e-10 | 14430 |
| 2.9317377857139794e-10 | 14440 |
| 2.8860689409816957e-10 | 14450 |
| 2.841111497995269e-10 | 14460 |
| 2.796854374966972e-10 | 14470 |
| 2.753286662734458e-10 | 14480 |
| 2.7103976220717393e-10 | 14490 |
| 2.668176681042049e-10 | 14500 |
| 2.626613432391851e-10 | 14510 |
| 2.5856976309855466e-10 | 14520 |
| 2.5454191912800735e-10 | 14530 |
| 2.5057681848389103e-10 | 14540 |
| 2.466734837884713e-10 | 14550 |
| 2.42830952889015e-10 | 14560 |
| 2.39048278620627e-10 | 14570 |
| 2.3532452857277403e-10 | 14580 |
| 2.3165878485945175e-10 | 14590 |
| 2.280501438929339e-10 | 14600 |
| 2.2449771616103668e-10 | 14610 |
| 2.2100062600786196e-10 | 14620 |
| 2.175580114179508e-10 | 14630 |
| 2.14169023803804e-10 | 14640 |
| 2.108328277967049e-10 | 14650 |
| 2.0754860104080716e-10 | 14660 |
| 2.043155339904308e-10 | 14670 |
| 2.0113282971050821e-10 | 14680 |
| 1.9799970368014632e-10 | 14690 |
| 1.9491538359924773e-10 | 14700 |
| 1.9187910919813867e-10 | 14710 |
| 1.8889013205016887e-10 | 14720 |
| 1.8594771538722681e-10 | 14730 |
| 1.8305113391813272e-10 | 14740 |
| 1.801996736498537e-10 | 14750 |
| 1.773926317115103e-10 | 14760 |
| 1.7462931618112388e-10 | 14770 |
| 1.7190904591505763e-10 | 14780 |
| 1.6923115038012e-10 | 14790 |
| 1.6659496948828307e-10 | 14800 |
| 1.6399985343397091e-10 | 14810 |
| 1.614451625338878e-10 | 14820 |
| 1.5893026706933846e-10 | 14830 |
| 1.564545471310076e-10 | 14840 |
| 1.5401739246615223e-10 | 14850 |
| 1.5161820232817863e-10 | 14860 |
| 1.4925638532856344e-10 | 14870 |
| 1.4693135929107554e-10 | 14880 |
| 1.4464255110827457e-10 | 14890 |
| 1.4238939660024395e-10 | 14900 |
| 1.4017134037552042e-10 | 14910 |
| 1.379878356941948e-10 | 14920 |
| 1.3583834433314223e-10 | 14930 |
| 1.3372233645335506e-10 | 14940 |
| 1.3163929046933666e-10 | 14950 |
| 1.295886929205353e-10 | 14960 |
| 1.2757003834477954e-10 | 14970 |
| 1.2558282915368185e-10 | 14980 |
| 1.2362657550998715e-10 | 14990 |
| 1.217007952068296e-10 | 15000 |
| 1.1980501354887255e-10 | 15010 |
| 1.1793876323529613e-10 | 15020 |
| 1.16101584244611e-10 | 15030 |
| 1.1429302372126663e-10 | 15040 |
| 1.1251263586402225e-10 | 15050 |
| 1.107599818160601e-10 | 15060 |
| 1.090346295568108e-10 | 15070 |
| 1.073361537954598e-10 | 15080 |
| 1.0566413586611705e-10 | 15090 |
| 1.0401816362461712e-10 | 15100 |
| 1.0239783134692911e-10 | 15110 |
| 1.0080273962914556e-10 | 15120 |
| 9.92324952890324e-11 | 15130 |
| 9.768671126911255e-11 | 15140 |
| 9.616500654125605e-11 | 15150 |
| 9.466700601275957e-11 | 15160 |
| 9.319234043388891e-11 | 15170 |
| 9.174064630685876e-11 | 15180 |
| 9.031156579623358e-11 | 15190 |
| 8.890474664072233e-11 | 15200 |
| 8.751984206634909e-11 | 15210 |
| 8.615651070097302e-11 | 15220 |
| 8.48144164901428e-11 | 15230 |
| 8.349322861426179e-11 | 15240 |
| 8.219262140704078e-11 | 15250 |
| 8.091227427522379e-11 | 15260 |
| 7.965187161956432e-11 | 15270 |
| 7.841110275702985e-11 | 15280 |
| 7.718966184422126e-11 | 15290 |
| 7.598724780198333e-11 | 15300 |
| 7.480356424119134e-11 | 15310 |
| 7.363831938969095e-11 | 15320 |
| 7.249122602037865e-11 | 15330 |
| 7.136200138040244e-11 | 15340 |
| 7.02503671214631e-11 | 15350 |
| 6.915604923120354e-11 | 15360 |
| 6.80787779656668e-11 | 15370 |
| 6.701828778280399e-11 | 15380 |
| 6.597431727702051e-11 | 15390 |
| 6.494660911474037e-11 | 15400 |
| 6.393490997097569e-11 | 15410 |
| 6.29389704668819e-11 | 15420 |
| 6.195854510828782e-11 | 15430 |
| 6.09933922251832e-11 | 15440 |
| 6.004327391214697e-11 | 15450 |
| 5.910795596970532e-11 | 15460 |
| 5.81872078466034e-11 | 15470 |
| 5.7280802582974244e-11 | 15480 |
| 5.638851675439515e-11 | 15490 |
| 5.551013041681425e-11 | 15500 |
| 5.464542705233621e-11 | 15510 |
| 5.3794193515850373e-11 | 15520 |
| 5.295621998249222e-11 | 15530 |
| 5.2131299895923127e-11 | 15540 |
| 5.131922991741403e-11 | 15550 |
| 5.0519809875724156e-11 | 15560 |
| 4.973284271776018e-11 | 15570 |
| 4.895813446000263e-11 | 15580 |
| 4.819549414069057e-11 | 15590 |
| 4.744473377275018e-11 | 15600 |
| 4.670566829745748e-11 | 15610 |
| 4.5978115538821305e-11 | 15620 |
| 4.5261896158678305e-11 | 15630 |
| 4.455683361248745e-11 | 15640 |
| 4.3862754105811746e-11 | 15650 |
| 4.31794865514792e-11 | 15660 |
| 4.2506862527411174e-11 | 15670 |
| 4.1844716235106214e-11 | 15680 |
| 4.119288445877219e-11 | 15690 |
| 4.0551206525094075e-11 | 15700 |
| 3.9919524263629395e-11 | 15710 |
| 3.9297681967819045e-11 | 15720 |
| 3.8685526356606926e-11 | 15730 |
| 3.808290653665728e-11 | 15740 |
| 3.748967396515938e-11 | 15750 |
| 3.6905682413212925e-11 | 15760 |
| 3.6330787929783696e-11 | 15770 |
| 3.5764848806219567e-11 | 15780 |
| 3.520772554132053e-11 | 15790 |
| 3.46592808069521e-11 | 15800 |
| 3.41193794141951e-11 | 15810 |
| 3.3587888280021484e-11 | 15820 |
| 3.306467639449048e-11 | 15830 |
| 3.254961478845552e-11 | 15840 |
| 3.204257650177342e-11 | 15850 |
| 3.154343655200954e-11 | 15860 |
| 3.1052071903630686e-11 | 15870 |
| 3.05683614376767e-11 | 15880 |
| 3.0092185921905734e-11 | 15890 |
| 2.9623427981403854e-11 | 15900 |
| 2.916197206965312e-11 | 15910 |
| 2.8707704440049322e-11 | 15920 |
| 2.8260513117864313e-11 | 15930 |
| 2.7820287872645084e-11 | 15940 |
| 2.7386920191041923e-11 | 15950 |
| 2.696030325006068e-11 | 15960 |
| 2.6540331890731746e-11 | 15970 |
| 2.6126902592188284e-11 | 15980 |
| 2.571991344614923e-11 | 15990 |
| 2.5319264131799257e-11 | 16000 |
| 2.492485589106049e-11 | 16010 |
| 2.4536591504248636e-11 | 16020 |
| 2.4154375266109057e-11 | 16030 |
| 2.3778112962226174e-11 | 16040 |
| 2.3407711845799543e-11 | 16050 |
| 2.304308061478249e-11 | 16060 |
| 2.2684129389376867e-11 | 16070 |
| 2.2330769689877623e-11 | 16080 |
| 2.1982914414863302e-11 | 16090 |
| 2.1640477819725857e-11 | 16100 |
| 2.1303375495535286e-11 | 16110 |
| 2.0971524348232838e-11 | 16120 |
| 2.0644842578148916e-11 | 16130 |
| 2.0323249659840122e-11 | 16140 |
| 2.0006666322239674e-11 | 16150 |
| 1.969501452911778e-11 | 16160 |
| 1.9388217459845944e-11 | 16170 |
| 1.908619949046134e-11 | 16180 |
| 1.878888617502546e-11 | 16190 |
| 1.8496204227273777e-11 | 16200 |
| 1.8208081502551224e-11 | 16210 |
| 1.7924446980028512e-11 | 16220 |
| 1.7645230745196035e-11 | 16230 |
| 1.7370363972630488e-11 | 16240 |
| 1.7099778909029338e-11 | 16250 |
| 1.6833408856510244e-11 | 16260 |
| 1.6571188156170237e-11 | 16270 |
| 1.631305217190134e-11 | 16280 |
| 1.605893727445775e-11 | 16290 |
| 1.5808780825771722e-11 | 16300 |
| 1.5562521163513745e-11 | 16310 |
| 1.532009758589277e-11 | 16320 |
| 1.508145033669366e-11 | 16330 |
| 1.4846520590547766e-11 | 16340 |
| 1.4615250438432422e-11 | 16350 |
| 1.4387582873396875e-11 | 16360 |
| 1.4163461776510251e-11 | 16370 |
| 1.3942831903028729e-11 | 16380 |
| 1.3725638868777653e-11 | 16390 |
| 1.3511829136746285e-11 | 16400 |
| 1.330135000389132e-11 | 16410 |
| 1.3094149588145566e-11 | 16420 |
| 1.2890176815629413e-11 | 16430 |
| 1.268938140806151e-11 | 16440 |
| 1.249171387036514e-11 | 16450 |
| 1.229712547846812e-11 | 16460 |
| 1.2105568267292451e-11 | 16470 |
| 1.1916995018931361e-11 | 16480 |
| 1.1731359251010038e-11 | 16490 |
| 1.1548615205228108e-11 | 16500 |
| 1.1368717836080542e-11 | 16510 |
| 1.1191622799753933e-11 | 16520 |
| 1.1017286443196083e-11 | 16530 |
| 1.0845665793355845e-11 | 16540 |
| 1.067671854659026e-11 | 16550 |
| 1.051040305823707e-11 | 16560 |
| 1.034667833234943e-11 | 16570 |
| 1.0185504011590771e-11 | 16580 |
| 1.0026840367286679e-11 | 16590 |
| 9.870648289632096e-12 | 16600 |
| 9.71688927805105e-12 | 16610 |
| 9.565525431706231e-12 | 16620 |
| 9.416519440156748e-12 | 16630 |
| 9.26983457416137e-12 | 16640 |
| 9.12543467662475e-12 | 16650 |
| 8.983284153685033e-12 | 16660 |
| 8.843347965940055e-12 | 16670 |
| 8.705591619810445e-12 | 16680 |
| 8.569981159036933e-12 | 16690 |
| 8.436483156310394e-12 | 16700 |
| 8.305064705032277e-12 | 16710 |
| 8.175693411203106e-12 | 16720 |
| 8.048337385437609e-12 | 16730 |
| 7.92296523510423e-12 | 16740 |
| 7.799546056586823e-12 | 16750 |
| 7.678049427667191e-12 | 16760 |
| 7.558445400026085e-12 | 16770 |
| 7.440704491861212e-12 | 16780 |
| 7.324797680619954e-12 | 16790 |
| 7.210696395845528e-12 | 16800 |
| 7.098372512134588e-12 | 16810 |
| 6.9877983422043e-12 | 16820 |
| 6.87894663006764e-12 | 16830 |
| 6.7717905443149986e-12 | 16840 |
| 6.666303671500229e-12 | 16850 |
| 6.562460009629952e-12 | 16860 |
| 6.4602339617541554e-12 | 16870 |
| 6.35960032965676e-12 | 16880 |
| 6.260534307644241e-12 | 16890 |
| 6.163011476431226e-12 | 16900 |
| 6.06700779712132e-12 | 16910 |
| 5.9724996052815054e-12 | 16920 |
| 5.8794636051090485e-12 | 16930 |
| 5.78787686368925e-12 | 16940 |
| 5.69771680534248e-12 | 16950 |
| 5.608961206059465e-12 | 16960 |
| 5.521588188023131e-12 | 16970 |
| 5.43557621421592e-12 | 16980 |
| 5.350904083110897e-12 | 16990 |
| 5.267550923445742e-12 | 17000 |
| 5.185496189078134e-12 | 17010 |
| 5.104719653921125e-12 | 17020 |
| 5.025201406957562e-12 | 17030 |
| 4.946921847332175e-12 | 17040 |
| 4.869861679519952e-12 | 17050 |
| 4.794001908569962e-12 | 17060 |
| 4.719323835423157e-12 | 17070 |
| 4.645809052303214e-12 | 17080 |
| 4.573439438179009e-12 | 17090 |
| 4.5021971542979205e-12 | 17100 |
| 4.432064639788719e-12 | 17110 |
| 4.363024607332794e-12 | 17120 |
| 4.2950600389029695e-12 | 17130 |
| 4.228154181568691e-12 | 17140 |
| 4.162290543366412e-12 | 17150 |
| 4.097452889234475e-12 | 17160 |
| 4.033625237011216e-12 | 17170 |
| 3.9707918534955e-12 | 17180 |
| 3.9089372505684715e-12 | 17190 |
| 3.848046181375865e-12 | 17200 |
| 3.7881036365697595e-12 | 17210 |
| 3.729094840608776e-12 | 17220 |
| 3.671005248116013e-12 | 17230 |
| 3.6138205402937273e-12 | 17240 |
| 3.55752662139374e-12 | 17250 |
| 3.5021096152429564e-12 | 17260 |
| 3.447555861822934e-12 | 17270 |
| 3.3938519139028022e-12 | 17280 |
| 3.3409845337245154e-12 | 17290 |
| 3.2889406897398447e-12 | 17300 |
| 3.2377075533982067e-12 | 17310 |
| 3.187272495984409e-12 | 17320 |
| 3.137623085505779e-12 | 17330 |
| 3.0887470836277685e-12 | 17340 |
| 3.040632442657195e-12 | 17350 |
| 2.9932673025725962e-12 | 17360 |
| 2.9466399881007638e-12 | 17370 |
| 2.9007390058388937e-12 | 17380 |
| 2.855553041421454e-12 | 17390 |
| 2.811070956731282e-12 | 17400 |
| 2.7672817871541235e-12 | 17410 |
| 2.7241747388758485e-12 | 17420 |
| 2.6817391862218676e-12 | 17430 |
| 2.6399646690379413e-12 | 17440 |
| 2.5988408901118373e-12 | 17450 |
| 2.5583577126350618e-12 | 17460 |
| 2.5185051577042176e-12 | 17470 |
| 2.479273401861279e-12 | 17480 |
| 2.440652774672102e-12 | 17490 |
| 2.40263375634274e-12 | 17500 |
| 2.365206975372887e-12 | 17510 |
| 2.3283632062457946e-12 | 17520 |
| 2.292093367154266e-12 | 17530 |
| 2.2563885177620147e-12 | 17540 |
| 2.2212398569999524e-12 | 17550 |
| 2.186638720896716e-12 | 17560 |
| 2.152576580443069e-12 | 17570 |
| 2.1190450394895648e-12 | 17580 |
| 2.0860358326768907e-12 | 17590 |
| 2.053540823398521e-12 | 17600 |
| 2.021552001795107e-12 | 17610 |
| 1.9900614827800397e-12 | 17620 |
| 1.9590615040958454e-12 | 17630 |
| 1.9285444244008146e-12 | 17640 |
| 1.8985027213854744e-12 | 17650 |
| 1.8689289899183344e-12 | 17660 |
| 1.8398159402205843e-12 | 17670 |
| 1.8111563960692128e-12 | 17680 |
| 1.7829432930280678e-12 | 17690 |
| 1.755169676706527e-12 | 17700 |
| 1.727828701045294e-12 | 17710 |
| 1.7009136266288403e-12 | 17720 |
| 1.674417819024198e-12 | 17730 |
| 1.6483347471455924e-12 | 17740 |
| 1.622657981644585e-12 | 17750 |
| 1.5973811933252368e-12 | 17760 |
| 1.5724981515840086e-12 | 17770 |
| 1.5480027228739667e-12 | 17780 |
| 1.5238888691928585e-12 | 17790 |
| 1.5001506465947927e-12 | 17800 |
| 1.4767822037251014e-12 | 17810 |
| 1.4537777803779784e-12 | 17820 |
| 1.4311317060766384e-12 | 17830 |
| 1.4088383986755604e-12 | 17840 |
| 1.3868923629845397e-12 | 17850 |
| 1.365288189414117e-12 | 17860 |
| 1.3440205526421595e-12 | 17870 |
| 1.3230842103012076e-12 | 17880 |
| 1.3024740016862286e-12 | 17890 |
| 1.282184846482544e-12 | 17900 |
| 1.2622117435135695e-12 | 17910 |
| 1.2425497695080234e-12 | 17920 |
| 1.2231940778863808e-12 | 17930 |
| 1.2041398975662094e-12 | 17940 |
| 1.185382531786136e-12 | 17950 |
| 1.1669173569480943e-12 | 17960 |
| 1.1487398214776421e-12 | 17970 |
| 1.1308454447020338e-12 | 17980 |
| 1.113229815745732e-12 | 17990 |
| 1.0958885924431607e-12 | 18000 |
| 1.0788175002683947e-12 | 18010 |
| 1.0620123312814865e-12 | 18020 |
| 1.0454689430912453e-12 | 18030 |
| 1.0291832578341508e-12 | 18040 |
| 1.0131512611691941e-12 | 18050 |
| 9.973690012883417e-13 | 18060 |
| 9.818325879424436e-13 | 18070 |
| 9.665381914823183e-13 | 18080 |
| 9.51482041914741e-13 | 18090 |
| 9.366604279731693e-13 | 18100 |
| 9.22069696202946e-13 | 18110 |
| 9.077062500607185e-13 | 18120 |
| 8.935665490279228e-13 | 18130 |
| 8.796471077380567e-13 | 18140 |
| 8.659444951175668e-13 | 18150 |
| 8.524553335400865e-13 | 18160 |
| 8.391762979938782e-13 | 18170 |
| 8.261041152622423e-13 | 18180 |
| 8.132355631166677e-13 | 18190 |
| 8.005674695225779e-13 | 18200 |
| 7.880967118574478e-13 | 18210 |
| 7.758202161410766e-13 | 18220 |
| 7.637349562778776e-13 | 18230 |
| 7.518379533109545e-13 | 18240 |
| 7.401262746878153e-13 | 18250 |
| 7.285970335374955e-13 | 18260 |
| 7.172473879589669e-13 | 18270 |
| 7.060745403206312e-13 | 18280 |
| 6.950757365707016e-13 | 18290 |
| 6.842482655583506e-13 | 18300 |
| 6.735894583654322e-13 | 18310 |
| 6.630966876485919e-13 | 18320 |
| 6.527673669916492e-13 | 18330 |
| 6.425989502680541e-13 | 18340 |
| 6.325889310132886e-13 | 18350 |
| 6.227348418070224e-13 | 18360 |
| 6.130342536649119e-13 | 18370 |
| 6.034847754398748e-13 | 18380 |
| 5.940840532326706e-13 | 18390 |
| 5.848297698116835e-13 | 18400 |
| 5.75719644041741e-13 | 18410 |
| 5.667514303218143e-13 | 18420 |
| 5.57922918031496e-13 | 18430 |
| 5.492319309860896e-13 | 18440 |
| 5.406763269001984e-13 | 18450 |
| 5.322539968596511e-13 | 18460 |
| 5.239628648016705e-13 | 18470 |
| 5.158008870031401e-13 | 18480 |
| 5.077660515768253e-13 | 18490 |
| 4.998563779754584e-13 | 18500 |
| 4.920699165035489e-13 | 18510 |
| 4.84404747836783e-13 | 18520 |
| 4.768589825489263e-13 | 18530 |
| 4.694307606460854e-13 | 18540 |
| 4.62118251108237e-13 | 18550 |
| 4.549196514378792e-13 | 18560 |
| 4.4783318721572976e-13 | 18570 |
| 4.4085711166334604e-13 | 18580 |
| 4.3398970521254263e-13 | 18590 |
| 4.272292750815311e-13 | 18600 |
| 4.205741548576627e-13 | 18610 |
| 4.1402270408665576e-13 | 18620 |
| 4.0757330786823886e-13 | 18630 |
| 4.012243764580824e-13 | 18640 |
| 3.949743448759404e-13 | 18650 |
| 3.888216725198818e-13 | 18660 |
| 3.8276484278654446e-13 | 18670 |
| 3.768023626973033e-13 | 18680 |
| 3.709327625302508e-13 | 18690 |
| 3.6515459545792323e-13 | 18700 |
| 3.594664371906619e-13 | 18710 |
| 3.5386688562553806e-13 | 18720 |
| 3.4835456050073367e-13 | 18730 |
| 3.4292810305531786e-13 | 18740 |
| 3.375861756943224e-13 | 18750 |
| 3.3232746165902375e-13 | 18760 |
| 3.271506647023726e-13 | 18770 |
| 3.220545087694786e-13 | 18780 |
| 3.1703773768306186e-13 | 18790 |
| 3.120991148338168e-13 | 18800 |
| 3.072374228755912e-13 | 18810 |
| 3.024514634253209e-13 | 18820 |
| 2.977400567676279e-13 | 18830 |
| 2.931020415640296e-13 | 18840 |
| 2.885362745666775e-13 | 18850 |
| 2.840416303365463e-13 | 18860 |
| 2.796170009660215e-13 | 18870 |
| 2.752612958058091e-13 | 18880 |
| 2.7097344119608953e-13 | 18890 |
| 2.6675238020187004e-13 | 18900 |
| 2.6259707235245324e-13 | 18910 |
| 2.585064933849704e-13 | 18920 |
| 2.544796349918995e-13 | 18930 |
| 2.505155045725259e-13 | 18940 |
| 2.4661312498827324e-13 | 18950 |
| 2.4277153432183856e-13 | 18960 |
| 2.389897856400871e-13 | 18970 |
| 2.352669467606405e-13 | 18980 |
| 2.3160210002209305e-13 | 18990 |
| 2.2799434205781657e-13 | 19000 |
| 2.244427835732831e-13 | 19010 |
| 2.2094654912686127e-13 | 19020 |
| 2.175047769140195e-13 | 19030 |
| 2.1411661855489823e-13 | 19040 |
| 2.1078123888519022e-13 | 19050 |
| 2.0749781575027232e-13 | 19060 |
| 2.0426553980255099e-13 | 19070 |
| 2.0108361430196364e-13 | 19080 |
| 1.979512549195824e-13 | 19090 |
| 1.9486768954428347e-13 | 19100 |
| 1.918321580924243e-13 | 19110 |
| 1.8884391232048938e-13 | 19120 |
| 1.8590221564064763e-13 | 19130 |
| 1.8300634293918958e-13 | 19140 |
| 1.8015558039779214e-13 | 19150 |
| 1.7734922531756193e-13 | 19160 |
| 1.7458658594582572e-13 | 19170 |
| 1.718669813056182e-13 | 19180 |
| 1.691897410278213e-13 | 19190 |
| 1.6655420518592369e-13 | 19200 |
| 1.639597241333509e-13 | 19210 |
| 1.614056583433333e-13 | 19220 |
| 1.5889137825126205e-13 | 19230 |
| 1.5641626409950653e-13 | 19240 |
| 1.5397970578464873e-13 | 19250 |
| 1.5158110270709237e-13 | 19260 |
| 1.4921986362301983e-13 | 19270 |
| 1.4689540649865508e-13 | 19280 |
| 1.446071583667919e-13 | 19290 |
| 1.4235455518556246e-13 | 19300 |
| 1.4013704169940296e-13 | 19310 |
| 1.379540713021875e-13 | 19320 |
| 1.3580510590248971e-13 | 19330 |
| 1.336896157909472e-13 | 19340 |
| 1.3160707950969225e-13 | 19350 |
| 1.2955698372381224e-13 | 19360 |
| 1.275388230948165e-13 | 19370 |
| 1.2555210015607423e-13 | 19380 |
| 1.235963251901888e-13 | 19390 |
| 1.216710161082864e-13 | 19400 |
| 1.197756983311829e-13 | 19410 |
| 1.17909904672404e-13 | 19420 |
| 1.1607317522302352e-13 | 19430 |
| 1.1426505723829946e-13 | 19440 |
| 1.1248510502607574e-13 | 19450 |
| 1.1073287983691907e-13 | 19460 |
| 1.0900794975597037e-13 | 19470 |
| 1.0730988959648117e-13 | 19480 |
| 1.0563828079500484e-13 | 19490 |
| 1.0399271130822432e-13 | 19500 |
| 1.0237277551138464e-13 | 19510 |
| 1.0077807409831002e-13 | 19520 |
| 9.920821398297457e-14 | 19530 |
| 9.766280820260963e-14 | 19540 |
| 9.614147582232054e-14 | 19550 |
| 9.464384184118574e-14 | 19560 |
| 9.316953709982215e-14 | 19570 |
| 9.171819818939013e-14 | 19580 |
| 9.028946736201297e-14 | 19590 |
| 8.888299244259509e-14 | 19600 |
| 8.749842674201217e-14 | 19610 |
| 8.613542897165499e-14 | 19620 |
| 8.479366315930176e-14 | 19630 |
| 8.347279856630356e-14 | 19640 |
| 8.217250960605968e-14 | 19650 |
| 8.089247576376049e-14 | 19660 |
| 7.963238151738287e-14 | 19670 |
| 7.83919162599166e-14 | 19680 |
| 7.717077422279937e-14 | 19690 |
| 7.596865440054765e-14 | 19700 |
| 7.478526047655968e-14 | 19710 |
| 7.362030075007595e-14 | 19720 |
| 7.247348806427483e-14 | 19730 |
| 7.134453973549069e-14 | 19740 |
| 7.023317748353445e-14 | 19750 |
| 6.913912736309731e-14 | 19760 |
| 6.806211969622554e-14 | 19770 |
| 6.70018890058468e-14 | 19780 |
| 6.595817395032981e-14 | 19790 |
| 6.493071725906607e-14 | 19800 |
| 6.391926566905335e-14 | 19810 |
| 6.292356986246858e-14 | 19820 |
| 6.194338440521076e-14 | 19830 |
| 6.09784676864035e-14 | 19840 |
| 6.002858185883973e-14 | 19850 |
| 5.909349278035214e-14 | 19860 |
| 5.817296995609929e-14 | 19870 |
| 5.726678648174928e-14 | 19880 |
| 5.637471898754979e-14 | 19890 |
| 5.549654758326729e-14 | 19900 |
| 5.4632055803985816e-14 | 19910 |
| 5.3781030556750054e-14 | 19920 |
| 5.294326206803774e-14 | 19930 |
| 5.211854383205213e-14 | 19940 |
| 5.130667255981997e-14 | 19950 |
| 5.050744812908054e-14 | 19960 |
| 4.972067353495732e-14 | 19970 |
| 4.894615484139686e-14 | 19980 |
| 4.818370113336522e-14 | 19990 |
| 4.743312446978734e-14 | 20000 |
| 4.6694239837220945e-14 | 20010 |
| 4.596686510425222e-14 | 20020 |
| 4.525082097660024e-14 | 20030 |
| 4.454593095292239e-14 | 20040 |
| 4.385202128130808e-14 | 20050 |
| 4.316892091644884e-14 | 20060 |
| 4.249646147747708e-14 | 20070 |
| 4.183447720646078e-14 | 20080 |
| 4.118280492754555e-14 | 20090 |
| 4.0541284006731696e-14 | 20100 |
| 3.990975631227918e-14 | 20110 |
| 3.928806617572938e-14 | 20120 |
| 3.867606035353267e-14 | 20130 |
| 3.807358798927511e-14 | 20140 |
| 3.7480500576493516e-14 | 20150 |
| 3.689665192206848e-14 | 20160 |
| 3.632189811018905e-14 | 20170 |
| 3.5756097466877955e-14 | 20180 |
| 3.519911052507014e-14 | 20190 |
| 3.465079999023408e-14 | 20200 |
| 3.411103070652975e-14 | 20210 |
| 3.357966962349371e-14 | 20220 |
| 3.305658576324212e-14 | 20230 |
| 3.25416501881857e-14 | 20240 |
| 3.20347359692476e-14 | 20250 |
| 3.153571815457527e-14 | 20260 |
| 3.1044473738740996e-14 | 20270 |
| 3.056088163242134e-14 | 20280 |
| 3.0084822632549744e-14 | 20290 |
| 2.961617939293287e-14 | 20300 |
| 2.9154836395325666e-14 | 20310 |
| 2.8700679920957e-14 | 20320 |
| 2.8253598022497942e-14 | 20330 |
| 2.7813480496467606e-14 | 20340 |
| 2.7380218856068804e-14 | 20350 |
| 2.695370630444604e-14 | 20360 |
| 2.653383770836096e-14 | 20370 |
| 2.6120509572277358e-14 | 20380 |
| 2.5713620012850333e-14 | 20390 |
| 2.531306873381241e-14 | 20400 |
| 2.4918757001250407e-14 | 20410 |
| 2.453058761926927e-14 | 20420 |
| 2.4148464906032314e-14 | 20430 |
| 2.3772294670177384e-14 | 20440 |
| 2.3401984187598607e-14 | 20450 |
| 2.3037442178589853e-14 | 20460 |
| 2.2678578785345774e-14 | 20470 |
| 2.2325305549811733e-14 | 20480 |
| 2.197753539187891e-14 | 20490 |
| 2.1635182587920428e-14 | 20500 |
| 2.1298162749660407e-14 | 20510 |
| 2.0966392803372223e-14 | 20520 |
| 2.0639790969402172e-14 | 20530 |
| 2.0318276742010702e-14 | 20540 |
| 2.0001770869527745e-14 | 20550 |
| 1.9690195334818413e-14 | 20560 |
| 1.9383473336051746e-14 | 20570 |
| 1.908152926776901e-14 | 20580 |
| 1.8784288702248163e-14 | 20590 |
| 1.849167837115736e-14 | 20600 |
| 1.8203626147494312e-14 | 20610 |
| 1.7920061027808205e-14 | 20620 |
| 1.7640913114696703e-14 | 20630 |
| 1.7366113599577456e-14 | 20640 |
| 1.709559474572676e-14 | 20650 |
| 1.6829289871582404e-14 | 20660 |
| 1.656713333430774e-14 | 20670 |
| 1.6309060513610682e-14 | 20680 |
| 1.6055007795814748e-14 | 20690 |
| 1.5804912558179342e-14 | 20700 |
| 1.5558713153463186e-14 | 20710 |
| 1.5316348894728234e-14 | 20720 |
| 1.5077760040381348e-14 | 20730 |
| 1.4842887779447902e-14 | 20740 |
| 1.46116742170749e-14 | 20750 |
| 1.4384062360260786e-14 | 20760 |
| 1.4159996103806646e-14 | 20770 |
| 1.3939420216486237e-14 | 20780 |
| 1.3722280327432389e-14 | 20790 |
| 1.3508522912734534e-14 | 20800 |
| 1.3298095282245041e-14 | 20810 |
| 1.3090945566592035e-14 | 20820 |
| 1.2887022704393086e-14 | 20830 |
| 1.2686276429669495e-14 | 20840 |
| 1.2488657259455684e-14 | 20850 |
| 1.229411648160163e-14 | 20860 |
| 1.2102606142766106e-14 | 20870 |
| 1.1914079036596126e-14 | 20880 |
| 1.1728488692090578e-14 | 20890 |
| 1.1545789362145862e-14 | 20900 |
| 1.1365936012279186e-14 | 20910 |
| 1.1188884309527551e-14 | 20920 |
| 1.1014590611520393e-14 | 20930 |
| 1.0843011955721687e-14 | 20940 |
| 1.0674106048839681e-14 | 20950 |
| 1.0507831256402275e-14 | 20960 |
| 1.0344146592494073e-14 | 20970 |
| 1.0183011709653368e-14 | 20980 |
| 1.0024386888927104e-14 | 20990 |
| 9.868233030080155e-15 | 21000 |
| 9.71451164195708e-15 | 21010 |
| 9.563184832994745e-15 | 21020 |
| 9.41421530188168e-15 | 21030 |
| 9.267566328363977e-15 | 21040 |
| 9.12320176419371e-15 | 21050 |
| 8.98108602421839e-15 | 21060 |
| 8.84118407760978e-15 | 21070 |
| 8.703461439228777e-15 | 21080 |
| 8.567884161124814e-15 | 21090 |
| 8.434418824168221e-15 | 21100 |
| 8.3030325298124e-15 | 21110 |
| 8.173692891984305e-15 | 21120 |
| 8.046368029101802e-15 | 21130 |
| 7.92102655621483e-15 | 21140 |
| 7.797637577269003e-15 | 21150 |
| 7.676170677490217e-15 | 21160 |
| 7.556595915887397e-15 | 21170 |
| 7.43888381787202e-15 | 21180 |
| 7.32300536799316e-15 | 21190 |
| 7.20893200278489e-15 | 21200 |
| 7.096635603725904e-15 | 21210 |
| 6.986088490308273e-15 | 21220 |
| 6.877263413214192e-15 | 21230 |
| 6.770133547599461e-15 | 21240 |
| 6.664672486481141e-15 | 21250 |
| 6.560854234228212e-15 | 21260 |
| 6.458653200154077e-15 | 21270 |
| 6.358044192208435e-15 | 21280 |
| 6.2590024107674265e-15 | 21290 |
| 6.161503442520927e-15 | 21300 |
| 6.065523254454645e-15 | 21310 |
| 5.971038187925972e-15 | 21320 |
| 5.878024952832515e-15 | 21330 |
| 5.786460621871054e-15 | 21340 |
| 5.696322624885963e-15 | 21350 |
| 5.607588743306027e-15 | 21360 |
| 5.5202371046675406e-15 | 21370 |
| 5.43424617722274e-15 | 21380 |
| 5.349594764632615e-15 | 21390 |
| 5.266262000741795e-15 | 21400 |
| 5.184227344435421e-15 | 21410 |
| 5.103470574575742e-15 | 21420 |
| 5.0239717850176e-15 | 21430 |
| 4.945711379701879e-15 | 21440 |
| 4.86867006782506e-15 | 21450 |
| 4.792828859084041e-15 | 21460 |
| 4.7181690589953155e-15 | 21470 |
| 4.6446722642867816e-15 | 21480 |
| 4.5723203583613024e-15 | 21490 |
| 4.501095506831322e-15 | 21500 |
| 4.430980153122583e-15 | 21510 |
| 4.3619570141464794e-15 | 21520 |
| 4.294009076040043e-15 | 21530 |
| 4.227119589972008e-15 | 21540 |
| 4.161272068014223e-15 | 21550 |
| 4.096450279077635e-15 | 21560 |
| 4.032638244911314e-15 | 21570 |
| 3.9698202361638115e-15 | 21580 |
| 3.907980768506151e-15 | 21590 |
| 3.84710459881479e-15 | 21600 |
| 3.7871767214144654e-15 | 21610 |
| 3.7281823643792794e-15 | 21620 |
| 3.670106985891415e-15 | 21630 |
| 3.612936270656812e-15 | 21640 |
| 3.556656126376431e-15 | 21650 |
| 3.501252680272506e-15 | 21660 |
| 3.446712275669114e-15 | 21670 |
| 3.393021468625803e-15 | 21680 |
| 3.340167024623651e-15 | 21690 |
| 3.2881359153031712e-15 | 21700 |
| 3.236915315252809e-15 | 21710 |
| 3.1864925988474724e-15 | 21720 |
| 3.1368553371365212e-15 | 21730 |
| 3.0879912947800175e-15 | 21740 |
| 3.0398884270327104e-15 | 21750 |
| 2.9925348767751986e-15 | 21760 |
| 2.9459189715911417e-15 | 21770 |
| 2.900029220890006e-15 | 21780 |
| 2.8548543130748353e-15 | 21790 |
| 2.810383112753835e-15 | 21800 |
| 2.7666046579956926e-15 | 21810 |
| 2.7235081576274577e-15 | 21820 |
| 2.6810829885745122e-15 | 21830 |
| 2.6393186932421508e-15 | 21840 |
| 2.598204976937775e-15 | 21850 |
| 2.557731705333252e-15 | 21860 |
| 2.5178889019669606e-15 | 21870 |
| 2.4786667457845856e-15 | 21880 |
| 2.4400555687182277e-15 | 21890 |
| 2.402045853303374e-15 | 21900 |
| 2.36462823033284e-15 | 21910 |
| 2.3277934765472557e-15 | 21920 |
| 2.291532512361677e-15 | 21930 |
| 2.2558363996274627e-15 | 21940 |
| 2.2206963394290184e-15 | 21950 |
| 2.1861036699150025e-15 | 21960 |
| 2.152049864163173e-15 | 21970 |
| 2.1185265280785013e-15 | 21980 |
| 2.0855253983241713e-15 | 21990 |
| 2.053038340284591e-15 | 22000 |
| 2.021057346060351e-15 | 22010 |
| 1.989574532494276e-15 | 22020 |
| 1.958582139228219e-15 | 22030 |
| 1.928072526790259e-15 | 22040 |
| 1.8980381747115644e-15 | 22050 |
| 1.8684716796725958e-15 | 22060 |
| 1.839365753678305e-15 | 22070 |
| 1.8107132222616398e-15 | 22080 |
| 1.782507022715032e-15 | 22090 |
| 1.754740202349557e-15 | 22100 |
| 1.727405916781087e-15 | 22110 |
| 1.70049742824315e-15 | 22120 |
| 1.6740081039261772e-15 | 22130 |
| 1.64793141434251e-15 | 22140 |
| 1.6222609317168785e-15 | 22150 |
| 1.5969903284020596e-15 | 22160 |
| 1.5721133753191035e-15 | 22170 |
| 1.5476239404218674e-15 | 22180 |
| 1.5235159871855708e-15 | 22190 |
| 1.4997835731187378e-15 | 22200 |
| 1.476420848298474e-15 | 22210 |
| 1.4534220539284605e-15 | 22220 |
| 1.430781520919406e-15 | 22230 |
| 1.4084936684917065e-15 | 22240 |
| 1.3865530027997806e-15 | 22250 |
| 1.364954115577833e-15 | 22260 |
| 1.3436916828068036e-15 | 22270 |
| 1.3227604634019938e-15 | 22280 |
| 1.3021552979211349e-15 | 22290 |
| 1.2818711072926708e-15 | 22300 |
| 1.2619028915637599e-15 | 22310 |
| 1.242245728667787e-15 | 22320 |
| 1.2228947732111524e-15 | 22330 |
| 1.2038452552788768e-15 | 22340 |
| 1.1850924792588171e-15 | 22350 |
| 1.1666318226842815e-15 | 22360 |
| 1.1484587350945447e-15 | 22370 |
| 1.130568736913242e-15 | 22380 |
| 1.11295741834415e-15 | 22390 |
| 1.09562043828417e-15 | 22400 |
| 1.078553523253315e-15 | 22410 |
| 1.0617524663412944e-15 | 22420 |
| 1.0452131261705082e-15 | 22430 |
| 1.0289314258752645e-15 | 22440 |
| 1.012903352096828e-15 | 22450 |
| 9.971249539941256e-16 | 22460 |
| 9.815923422699283e-16 | 22470 |
| 9.66301688212135e-16 | 22480 |
| 9.51249222749994e-16 | 22490 |
| 9.364312355250878e-16 | 22500 |
| 9.21844073976726e-16 | 22510 |
| 9.074841424415885e-16 | 22520 |
| 8.933479012674514e-16 | 22530 |
| 8.794318659406599e-16 | 22540 |
| 8.657326062271945e-16 | 22550 |
| 8.522467453271798e-16 | 22560 |
| 8.389709590424691e-16 | 22570 |
| 8.259019749572899e-16 | 22580 |
| 8.13036571631591e-16 | 22590 |
| 8.00371577806955e-16 | 22600 |
| 7.879038716249353e-16 | 22610 |
| 7.756303798575147e-16 | 22620 |
| 7.63548077149554e-16 | 22630 |
| 7.516539852730895e-16 | 22640 |
| 7.399451723931985e-16 | 22650 |
| 7.284187523452999e-16 | 22660 |
| 7.170718839237615e-16 | 22670 |
| 7.059017701815403e-16 | 22680 |
| 6.949056577407337e-16 | 22690 |
| 6.840808361139166e-16 | 22700 |
| 6.734246370360028e-16 | 22710 |
| 6.629344338065183e-16 | 22720 |
| 6.526076406421604e-16 | 22730 |
| 6.424417120394004e-16 | 22740 |
| 6.324341421470161e-16 | 22750 |
| 6.225824641484442e-16 | 22760 |
| 6.128842496536851e-16 | 22770 |
| 6.033371081007491e-16 | 22780 |
| 5.939386861663803e-16 | 22790 |
| 5.846866671859622e-16 | 22800 |
| 5.755787705824959e-16 | 22810 |
| 5.666127513044372e-16 | 22820 |
| 5.577863992722897e-16 | 22830 |
| 5.49097538833856e-16 | 22840 |
| 5.405440282279374e-16 | 22850 |
| 5.321237590563892e-16 | 22860 |
| 5.238346557644342e-16 | 22870 |
| 5.156746751290364e-16 | 22880 |
| 5.076418057552467e-16 | 22890 |
| 4.997340675804251e-16 | 22900 |
| 4.919495113861542e-16 | 22910 |
| 4.842862183177563e-16 | 22920 |
| 4.767422994113262e-16 | 22930 |
| 4.693158951280998e-16 | 22940 |
| 4.620051748960778e-16 | 22950 |
| 4.548083366588214e-16 | 22960 |
| 4.477236064312284e-16 | 22970 |
| 4.407492378622771e-16 | 22980 |
| 4.338835118045498e-16 | 22990 |
| 4.2712473589046216e-16 | 23000 |
| 4.2047124411512144e-16 | 23010 |
| 4.139213964256553e-16 | 23020 |
| 4.0747357831693803e-16 | 23030 |
| 4.011262004336405e-16 | 23040 |
| 3.948776981784536e-16 | 23050 |
| 3.887265313264134e-16 | 23060 |
| 3.826711836452613e-16 | 23070 |
| 3.767101625216909e-16 | 23080 |
| 3.708419985934184e-16 | 23090 |
| 3.650652453870085e-16 | 23100 |
| 3.5937847896131726e-16 | 23110 |
| 3.537802975564904e-16 | 23120 |
| 3.4826932124845153e-16 | 23130 |
| 3.4284419160875003e-16 | 23140 |
| 3.3750357136970783e-16 | 23150 |
| 3.3224614409480674e-16 | 23160 |
| 3.270706138541737e-16 | 23170 |
| 3.2197570490515786e-16 | 23180 |
| 3.1696016137785803e-16 | 23190 |
| 3.120227469655514e-16 | 23200 |
| 3.071622446199628e-16 | 23210 |
| 3.0237745625126174e-16 | 23220 |
| 2.976672024327328e-16 | 23230 |
| 2.930303221100657e-16 | 23240 |
| 2.884656723151546e-16 | 23250 |
| 2.839721278843558e-16 | 23260 |
| 2.795485811811531e-16 | 23270 |
| 2.7519394182312463e-16 | 23280 |
| 2.709071364131628e-16 | 23290 |
| 2.666871082748994e-16 | 23300 |
| 2.625328171922338e-16 | 23310 |
| 2.584432391529195e-16 | 23320 |
| 2.5441736609616136e-16 | 23330 |
| 2.5045420566412774e-16 | 23340 |
| 2.465527809573341e-16 | 23350 |
| 2.4271213029385445e-16 | 23360 |
| 2.389313069722575e-16 | 23370 |
| 2.3520937903826165e-16 | 23380 |
| 2.315454290550073e-16 | 23390 |
| 2.2793855387690876e-16 | 23400 |
| 2.2438786442704275e-16 | 23410 |
| 2.2089248547799071e-16 | 23420 |
| 2.1745155543609476e-16 | 23430 |
| 2.1406422612908845e-16 | 23440 |
| 2.1072966259702182e-16 | 23450 |
| 2.0744704288644345e-16 | 23460 |
| 2.0421555784780205e-16 | 23470 |
| 2.010344109359903e-16 | 23480 |
| 1.9790281801399643e-16 | 23490 |
| 1.948200071596268e-16 | 23500 |
| 1.9178521847522659e-16 | 23510 |
| 1.8879770390036458e-16 | 23520 |
| 1.8585672702744836e-16 | 23530 |
| 1.8296156292019927e-16 | 23540 |
| 1.8011149793495523e-16 | 23550 |
| 1.7730582954477024e-16 | 23560 |
| 1.7454386616623477e-16 | 23570 |
| 1.7182492698901269e-16 | 23580 |
| 1.69148341808021e-16 | 23590 |
| 1.6651345085822408e-16 | 23600 |
| 1.6391960465201206e-16 | 23610 |
| 1.6136616381910165e-16 | 23620 |
| 1.5885249894893125e-16 | 23630 |
| 1.5637799043552106e-16 | 23640 |
| 1.5394202832473987e-16 | 23650 |
| 1.515440121639512e-16 | 23660 |
| 1.4918335085401116e-16 | 23670 |
| 1.4685946250356206e-16 | 23680 |
| 1.4457177428559618e-16 | 23690 |
| 1.4231972229626276e-16 | 23700 |
| 1.4010275141586547e-16 | 23710 |
| 1.379203151720252e-16 | 23720 |
| 1.3577187560498405e-16 | 23730 |
| 1.3365690313499346e-16 | 23740 |
| 1.3157487643178175e-16 | 23750 |
| 1.295252822860462e-16 | 23760 |
| 1.2750761548294655e-16 | 23770 |
| 1.2552137867757768e-16 | 23780 |
| 1.235660822723737e-16 | 23790 |
| 1.2164124429642202e-16 | 23800 |
| 1.1974639028666496e-16 | 23810 |
| 1.1788105317094468e-16 | 23820 |
| 1.160447731528693e-16 | 23830 |
| 1.1423709759848067e-16 | 23840 |
| 1.1245758092467963e-16 | 23850 |
| 1.107057844893897e-16 | 23860 |
| 1.0898127648343874e-16 | 23870 |
| 1.0728363182411766e-16 | 23880 |
| 1.0561243205039745e-16 | 23890 |
| 1.0396726521978511e-16 | 23900 |
| 1.0234772580677953e-16 | 23910 |
| 1.0075341460290941e-16 | 23920 |
| 9.918393861833528e-17 | 23930 |
| 9.76389109849738e-17 | 23940 |
| 9.61179508611416e-17 | 23950 |
| 9.462068333767761e-17 | 23960 |
| 9.314673934552773e-17 | 23970 |
| 9.169575556477521e-17 | 23980 |
| 9.026737433508199e-17 | 23990 |
| 8.886124356752537e-17 | 24000 |
| 8.747701665781369e-17 | 24010 |
| 8.611435240084801e-17 | 24020 |
| 8.477291490661499e-17 | 24030 |
| 8.345237351739546e-17 | 24040 |
| 8.215240272625682e-17 | 24050 |
| 8.087268209681569e-17 | 24060 |
| 7.961289618425523e-17 | 24070 |
| 7.837273445756797e-17 | 24080 |
| 7.715189122300963e-17 | 24090 |
| 7.595006554875057e-17 | 24100 |
| 7.476696119069588e-17 | 24110 |
| 7.360228651946099e-17 | 24120 |
| 7.245575444849034e-17 | 24130 |
| 7.132708236328764e-17 | 24140 |
| 7.021599205175653e-17 | 24150 |
| 6.912220963562094e-17 | 24160 |
| 6.804546550291419e-17 | 24170 |
| 6.698549424152375e-17 | 24180 |
| 6.59420345737671e-17 | 24190 |
| 6.491482929198657e-17 | 24200 |
| 6.390362519515188e-17 | 24210 |
| 6.290817302644573e-17 | 24220 |
| 6.1928227411822e-17 | 24230 |
| 6.096354679952507e-17 | 24240 |
| 6.001389340054682e-17 | 24250 |
| 5.907903313001191e-17 | 24260 |
| 5.815873554947931e-17 | 24270 |
| 5.725277381013923e-17 | 24280 |
| 5.636092459689465e-17 | 24290 |
| 5.548296807331789e-17 | 24300 |
| 5.461868782746058e-17 | 24310 |
| 5.3767870818508176e-17 | 24320 |
| 5.2930307324269084e-17 | 24330 |
| 5.210579088947614e-17 | 24340 |
| 5.1294118274899074e-17 | 24350 |
| 5.049508940724584e-17 | 24360 |
| 4.9708507329844535e-17 | 24370 |
| 4.8934178154096685e-17 | 24380 |
| 4.8171911011683533e-17 | 24390 |
| 4.7421518007517004e-17 | 24400 |
| 4.6682814173426483e-17 | 24410 |
| 4.595561742256406e-17 | 24420 |
| 4.523974850452007e-17 | 24430 |
| 4.453503096114065e-17 | 24440 |
| 4.3841291083030794e-17 | 24450 |
| 4.315835786673476e-17 | 24460 |
| 4.2486062972586626e-17 | 24470 |
| 4.1824240683214276e-17 | 24480 |
| 4.117272786269011e-17 | 24490 |
| 4.053136391632058e-17 | 24500 |
| 3.989999075105951e-17 | 24510 |
| 3.927845273653809e-17 | 24520 |
| 3.8666596666704733e-17 | 24530 |
| 3.806427172205832e-17 | 24540 |
| 3.747132943247386e-17 | 24550 |
| 3.68876236406045e-17 | 24560 |
| 3.631301046585368e-17 | 24570 |
| 3.5747348268910864e-17 | 24580 |
| 3.519049761683736e-17 | 24590 |
| 3.4642321248695984e-17 | 24600 |
| 3.410268404171854e-17 | 24610 |
| 3.3571452977997835e-17 | 24620 |
| 3.3048497111698795e-17 | 24630 |
| 3.253368753678237e-17 | 24640 |
| 3.2026897355230105e-17 | 24650 |
| 3.152800164576375e-17 | 24660 |
| 3.1036877433054105e-17 | 24670 |
| 3.055340365740757e-17 | 24680 |
| 3.007746114492485e-17 | 24690 |
| 2.960893257812649e-17 | 24700 |
| 2.9147702467034036e-17 | 24710 |
| 2.8693657120701704e-17 | 24720 |
| 2.82466846191936e-17 | 24730 |
| 2.780667478599433e-17 | 24740 |
| 2.737351916085246e-17 | 24750 |
| 2.6947110973045023e-17 | 24760 |
| 2.6527345115058454e-17 | 24770 |
| 2.6114118116681263e-17 | 24780 |
| 2.570732811949858e-17 | 24790 |
| 2.5306874851783985e-17 | 24800 |
| 2.4912659603784154e-17 | 24810 |
| 2.4524585203386808e-17 | 24820 |
| 2.4142555992167763e-17 | 24830 |
| 2.3766477801812653e-17 | 24840 |
| 2.3396257930904353e-17 | 24850 |
| 2.303180512207208e-17 | 24860 |
| 2.2673029539497874e-17 | 24870 |
| 2.2319842746771997e-17 | 24880 |
| 2.1972157685093364e-17 | 24890 |
| 2.1629888651811048e-17 | 24900 |
| 2.1292951279297772e-17 | 24910 |
| 2.0961262514154772e-17 | 24920 |
| 2.0634740596739082e-17 | 24930 |
| 2.0313305041009754e-17 | 24940 |
| 1.9996876614689333e-17 | 24950 |
| 1.9685377319733028e-17 | 24960 |
| 1.937873037310217e-17 | 24970 |
| 1.9076860187838427e-17 | 24980 |
| 1.8779692354431556e-17 | 24990 |
| 1.8487153622477424e-17 | 25000 |
| 0.03987727172919316 | 25010 |
| 0.039809163727695863 | 25020 |
| 0.03974118142335766 | 25030 |
| 0.039673324566904526 | 25040 |
| 0.03960559290959058 | 25050 |
| 0.03953798620319752 | 25060 |
| 0.039470504200033285 | 25070 |
| 0.03940314665293084 | 25080 |
| 0.03933591331524718 | 25090 |
| 0.03926880394086163 | 25100 |
| 0.03920181828417537 | 25110 |
| 0.039134956100109794 | 25120 |
| 0.03906821714410543 | 25130 |
| 0.039001601172120856 | 25140 |
| 0.03893510794063141 | 25150 |
| 0.03886873720662813 | 25160 |
| 0.03880248872761652 | 25170 |
| 0.03873636226161541 | 25180 |
| 0.03867035756715584 | 25190 |
| 0.038604474403279826 | 25200 |
| 0.038538712529539394 | 25210 |
| 0.03847307170599496 | 25220 |
| 0.03840755169321474 | 25230 |
| 0.03834215225227357 | 25240 |
| 0.03827687314475125 | 25250 |
| 0.03821171413273186 | 25260 |
| 0.038146674978802524 | 25270 |
| 0.038081755446052294 | 25280 |
| 0.0380169552980706 | 25290 |
| 0.03795227429894712 | 25300 |
| 0.03788771221326961 | 25310 |
| 0.03782326880612331 | 25320 |
| 0.03775894384308974 | 25330 |
| 0.03769473709024555 | 25340 |
| 0.037630648314161526 | 25350 |
| 0.037566677281901086 | 25360 |
| 0.03750282376101976 | 25370 |
| 0.03743908751956365 | 25380 |
| 0.037375468326068514 | 25390 |
| 0.0373119659495586 | 25400 |
| 0.03724858015954553 | 25410 |
| 0.03718531072602728 | 25420 |
| 0.03712215741948702 | 25430 |
| 0.03705912001089206 | 25440 |
| 0.036996198271692725 | 25450 |
| 0.03693339197382144 | 25460 |
| 0.03687070088969116 | 25470 |
| 0.036808124792194974 | 25480 |
| 0.03674566345470447 | 25490 |
| 0.03668331665106917 | 25500 |
| 0.03662108415561487 | 25510 |
| 0.036558965743142983 | 25520 |
| 0.03649696118892943 | 25530 |
| 0.03643507026872324 | 25540 |
| 0.036373292758745915 | 25550 |
| 0.03631162843569041 | 25560 |
| 0.03625007707671961 | 25570 |
| 0.036188638459465586 | 25580 |
| 0.036127312362028534 | 25590 |
| 0.03606609856297576 | 25600 |
| 0.0360049968413403 | 25610 |
| 0.03594400697662039 | 25620 |
| 0.03588312874877809 | 25630 |
| 0.035822361938238324 | 25640 |
| 0.03576170632588787 | 25650 |
| 0.035701161693074246 | 25660 |
| 0.03564072782160478 | 25670 |
| 0.03558040449374553 | 25680 |
| 0.03552019149222022 | 25690 |
| 0.03546008860020929 | 25700 |
| 0.035400095601348845 | 25710 |
| 0.03534021227972969 | 25720 |
| 0.035280438419896 | 25730 |
| 0.03522077380684482 | 25740 |
| 0.035161218226024624 | 25750 |
| 0.03510177146333473 | 25760 |
| 0.035042433305123764 | 25770 |
| 0.03498320353818903 | 25780 |
| 0.03492408194977546 | 25790 |
| 0.03486506832757429 | 25800 |
| 0.03480616245972255 | 25810 |
| 0.03474736413480197 | 25820 |
| 0.03468867314183763 | 25830 |
| 0.03463008927029725 | 25840 |
| 0.03457161231009021 | 25850 |
| 0.03451324205156652 | 25860 |
| 0.03445497828551564 | 25870 |
| 0.034396820803165876 | 25880 |
| 0.03433876939618313 | 25890 |
| 0.03428082385667004 | 25900 |
| 0.03422298397716492 | 25910 |
| 0.03416524955064082 | 25920 |
| 0.03410762037050462 | 25930 |
| 0.034050096230595954 | 25940 |
| 0.03399267692518633 | 25950 |
| 0.033935362248978126 | 25960 |
| 0.033878151997103645 | 25970 |
| 0.033821045965124204 | 25980 |
| 0.033764043949028925 | 25990 |
| 0.03370714574523418 | 26000 |
| 0.033650351150582306 | 26010 |
| 0.03359365996234102 | 26020 |
| 0.03353707197820199 | 26030 |
| 0.03348058699628024 | 26040 |
| 0.03342420481511317 | 26050 |
| 0.03336792523365931 | 26060 |
| 0.033311748051297774 | 26070 |
| 0.03325567306782737 | 26080 |
| 0.0331997000834652 | 26090 |
| 0.033143828898846074 | 26100 |
| 0.03308805931502152 | 26110 |
| 0.03303239113345892 | 26120 |
| 0.03297682415604024 | 26130 |
| 0.03292135818506164 | 26140 |
| 0.03286599302323219 | 26150 |
| 0.03281072847367305 | 26160 |
| 0.032755564339916554 | 26170 |
| 0.03270050042590528 | 26180 |
| 0.03264553653599116 | 26190 |
| 0.03259067247493455 | 26200 |
| 0.032535908047903336 | 26210 |
| 0.03248124306047203 | 26220 |
| 0.032426677318620846 | 26230 |
| 0.03237221062873489 | 26240 |
| 0.03231784279760296 | 26250 |
| 0.0322635736324171 | 26260 |
| 0.03220940294077131 | 26270 |
| 0.03215533053066109 | 26280 |
| 0.032101356210482 | 26290 |
| 0.03204747978902913 | 26300 |
| 0.031993701075496254 | 26310 |
| 0.03194001987947454 | 26320 |
| 0.03188643601095221 | 26330 |
| 0.03183294928031324 | 26340 |
| 0.03177955949833688 | 26350 |
| 0.0317262664761963 | 26360 |
| 0.03167307002545813 | 26370 |
| 0.031619969958081154 | 26380 |
| 0.03156696608641593 | 26390 |
| 0.03151405822320365 | 26400 |
| 0.03146124618157528 | 26410 |
| 0.03140852977505074 | 26420 |
| 0.031355908817538046 | 26430 |
| 0.03130338312333242 | 26440 |
| 0.03125095250711546 | 26450 |
| 0.031198616783954258 | 26460 |
| 0.031146375769300582 | 26470 |
| 0.031094229278989992 | 26480 |
| 0.031042177129241077 | 26490 |
| 0.030990219136654295 | 26500 |
| 0.03093835511821162 | 26510 |
| 0.030886584891275323 | 26520 |
| 0.030834908273587206 | 26530 |
| 0.030783325083268025 | 26540 |
| 0.030731835138816187 | 26550 |
| 0.03068043825910734 | 26560 |
| 0.030629134263393094 | 26570 |
| 0.030577922971300703 | 26580 |
| 0.0305268042028319 | 26590 |
| 0.030475777778362082 | 26600 |
| 0.03042484351863978 | 26610 |
| 0.030374001244785374 | 26620 |
| 0.030323250778290664 | 26630 |
| 0.030272591941017668 | 26640 |
| 0.030222024555198228 | 26650 |
| 0.03017154844343295 | 26660 |
| 0.030121163428690423 | 26670 |
| 0.03007086933430638 | 26680 |
| 0.030020665983982977 | 26690 |
| 0.02997055320178788 | 26700 |
| 0.029920530812153526 | 26710 |
| 0.029870598639876303 | 26720 |
| 0.029820756510115724 | 26730 |
| 0.029771004248393657 | 26740 |
| 0.029721341680593583 | 26750 |
| 0.029671768632959505 | 26760 |
| 0.02962228493209558 | 26770 |
| 0.029572890404965066 | 26780 |
| 0.029523584878889498 | 26790 |
| 0.029474368181548204 | 26800 |
| 0.02942524014097708 | 26810 |
| 0.02937620058556815 | 26820 |
| 0.029327249344068447 | 26830 |
| 0.029278386245579633 | 26840 |
| 0.029229611119556968 | 26850 |
| 0.029180923795808483 | 26860 |
| 0.029132324104494536 | 26870 |
| 0.02908381187612656 | 26880 |
| 0.02903538694156671 | 26890 |
| 0.02898704913202665 | 26900 |
| 0.028938798279067292 | 26910 |
| 0.0288906342145977 | 26920 |
| 0.028842556770874387 | 26930 |
| 0.028794565780500575 | 26940 |
| 0.028746661076425428 | 26950 |
| 0.028698842491943276 | 26960 |
| 0.02865110986069287 | 26970 |
| 0.028603463016656613 | 26980 |
| 0.0285559017941598 | 26990 |
| 0.0285084260278699 | 27000 |
| 0.028461035552795833 | 27010 |
| 0.02841373020428694 | 27020 |
| 0.028366509818032685 | 27030 |
| 0.028319374230061617 | 27040 |
| 0.028272323276740584 | 27050 |
| 0.028225356794774344 | 27060 |
| 0.028178474621204336 | 27070 |
| 0.028131676593408324 | 27080 |
| 0.0280849625490993 | 27090 |
| 0.028038332326325167 | 27100 |
| 0.02799178576346773 | 27110 |
| 0.027945322699241937 | 27120 |
| 0.027898942972695486 | 27130 |
| 0.027852646423207603 | 27140 |
| 0.027806432890488703 | 27150 |
| 0.02776030221457932 | 27160 |
| 0.02771425423584979 | 27170 |
| 0.027668288794999236 | 27180 |
| 0.027622405733054925 | 27190 |
| 0.02757660489137157 | 27200 |
| 0.0275308861116306 | 27210 |
| 0.027485249235839403 | 27220 |
| 0.027439694106330664 | 27230 |
| 0.02739422056576165 | 27240 |
| 0.02734882845711345 | 27250 |
| 0.02730351762369038 | 27260 |
| 0.027258287909119012 | 27270 |
| 0.027213139157347806 | 27280 |
| 0.027168071212646208 | 27290 |
| 0.027123083919603972 | 27300 |
| 0.02707817712313042 | 27310 |
| 0.027033350668453988 | 27320 |
| 0.026988604401121177 | 27330 |
| 0.02694393816699594 | 27340 |
| 0.026899351812259175 | 27350 |
| 0.026854845183407913 | 27360 |
| 0.026810418127254612 | 27370 |
| 0.026766070490926417 | 27380 |
| 0.02672180212186473 | 27390 |
| 0.026677612867824205 | 27400 |
| 0.026633502576872064 | 27410 |
| 0.02658947109738772 | 27420 |
| 0.026545518278061852 | 27430 |
| 0.026501643967895807 | 27440 |
| 0.026457848016200866 | 27450 |
| 0.02641413027259761 | 27460 |
| 0.026370490587015245 | 27470 |
| 0.026326928809690904 | 27480 |
| 0.02628344479116899 | 27490 |
| 0.026240038382300504 | 27500 |
| 0.026196709434242363 | 27510 |
| 0.02615345779845681 | 27520 |
| 0.026110283326710493 | 27530 |
| 0.026067185871074167 | 27540 |
| 0.02602416528392178 | 27550 |
| 0.025981221417929908 | 27560 |
| 0.02593835412607696 | 27570 |
| 0.025895563261642853 | 27580 |
| 0.025852848678207967 | 27590 |
| 0.025810210229652568 | 27600 |
| 0.025767647770156367 | 27610 |
| 0.025725161154197713 | 27620 |
| 0.02568275023655296 | 27630 |
| 0.025640414872295725 | 27640 |
| 0.02559815491679657 | 27650 |
| 0.02555597022572196 | 27660 |
| 0.02551386065503365 | 27670 |
| 0.0254718260609884 | 27680 |
| 0.025429866300136984 | 27690 |
| 0.0253879812293237 | 27700 |
| 0.0253461707056857 | 27710 |
| 0.025304434586652318 | 27720 |
| 0.0252627727299445 | 27730 |
| 0.025221184993574102 | 27740 |
| 0.025179671235843325 | 27750 |
| 0.025138231315344026 | 27760 |
| 0.025096865090957092 | 27770 |
| 0.02505557242185191 | 27780 |
| 0.025014353167485483 | 27790 |
| 0.024973207187602115 | 27800 |
| 0.024932134342232636 | 27810 |
| 0.02489113449169377 | 27820 |
| 0.02485020749658746 | 27830 |
| 0.024809353217800534 | 27840 |
| 0.024768571516503718 | 27850 |
| 0.024727862254151068 | 27860 |
| 0.024687225292479662 | 27870 |
| 0.024646660493508676 | 27880 |
| 0.02460616771953892 | 27890 |
| 0.024565746833152085 | 27900 |
| 0.024525397697210457 | 27910 |
| 0.02448512017485592 | 27920 |
| 0.0244449141295094 | 27930 |
| 0.024404779424870578 | 27940 |
| 0.024364715924916968 | 27950 |
| 0.02432472349390346 | 27960 |
| 0.024284801996361665 | 27970 |
| 0.024244951297099315 | 27980 |
| 0.024205171261199695 | 27990 |
| 0.024165461754021025 | 28000 |
| 0.02412582264119586 | 28010 |
| 0.0240862537886305 | 28020 |
| 0.024046755062504463 | 28030 |
| 0.024007326329269628 | 28040 |
| 0.02396796745565005 | 28050 |
| 0.02392867830864108 | 28060 |
| 0.02388945875550886 | 28070 |
| 0.02385030866378975 | 28080 |
| 0.02381122790128964 | 28090 |
| 0.023772216336083722 | 28100 |
| 0.023733273836515256 | 28110 |
| 0.023694400271195615 | 28120 |
| 0.02365559550900341 | 28130 |
| 0.02361685941908394 | 28140 |
| 0.023578191870848655 | 28150 |
| 0.02353959273397449 | 28160 |
| 0.023501061878403597 | 28170 |
| 0.023462599174342166 | 28180 |
| 0.023424204492260483 | 28190 |
| 0.023385877702892015 | 28200 |
| 0.023347618677232933 | 28210 |
| 0.023309427286541517 | 28220 |
| 0.023271303402337642 | 28230 |
| 0.023233246896402118 | 28240 |
| 0.02319525764077622 | 28250 |
| 0.023157335507761077 | 28260 |
| 0.02311948036991711 | 28270 |
| 0.0230816921000635 | 28280 |
| 0.023043970571277647 | 28290 |
| 0.023006315656894406 | 28300 |
| 0.02296872723050588 | 28310 |
| 0.022931205165960623 | 28320 |
| 0.022893749337363118 | 28330 |
| 0.022856359619073296 | 28340 |
| 0.022819035885705857 | 28350 |
| 0.02278177801213003 | 28360 |
| 0.022744585873468455 | 28370 |
| 0.022707459345097204 | 28380 |
| 0.022670398302644963 | 28390 |
| 0.022633402621992506 | 28400 |
| 0.022596472179272197 | 28410 |
| 0.022559606850867348 | 28420 |
| 0.022522806513411986 | 28430 |
| 0.02248607104378977 | 28440 |
| 0.02244940031913394 | 28450 |
| 0.02241279421682657 | 28460 |
| 0.02237625261449807 | 28470 |
| 0.022339775390026632 | 28480 |
| 0.022303362421537694 | 28490 |
| 0.022267013587403458 | 28500 |
| 0.022230728766242273 | 28510 |
| 0.02219450783691819 | 28520 |
| 0.02215835067854037 | 28530 |
| 0.022122257170462574 | 28540 |
| 0.02208622719228273 | 28550 |
| 0.022050260623842126 | 28560 |
| 0.022014357345225236 | 28570 |
| 0.021978517236759018 | 28580 |
| 0.021942740179012377 | 28590 |
| 0.02190702605279569 | 28600 |
| 0.021871374739160235 | 28610 |
| 0.021835786119397915 | 28620 |
| 0.021800260075040222 | 28630 |
| 0.02176479648785824 | 28640 |
| 0.021729395239861882 | 28650 |
| 0.021694056213299437 | 28660 |
| 0.021658779290657 | 28670 |
| 0.021623564354657995 | 28680 |
| 0.021588411288262856 | 28690 |
| 0.021553319974668018 | 28700 |
| 0.021518290297305943 | 28710 |
| 0.02148332213984433 | 28720 |
| 0.02144841538618569 | 28730 |
| 0.021413569920466807 | 28740 |
| 0.021378785627058264 | 28750 |
| 0.02134406239056393 | 28760 |
| 0.021309400095820438 | 28770 |
| 0.021274798627896736 | 28780 |
| 0.02124025787209353 | 28790 |
| 0.02120577771394287 | 28800 |
| 0.021171358039207458 | 28810 |
| 0.021136998733880426 | 28820 |
| 0.021102699684184663 | 28830 |
| 0.021068460776572366 | 28840 |
| 0.02103428189772455 | 28850 |
| 0.02100016293455054 | 28860 |
| 0.020966103774187513 | 28870 |
| 0.02093210430399998 | 28880 |
| 0.020898164411579323 | 28890 |
| 0.02086428398474327 | 28900 |
| 0.020830462911535463 | 28910 |
| 0.020796701080224928 | 28920 |
| 0.02076299837930561 | 28930 |
| 0.0207293546974959 | 28940 |
| 0.02069576992373814 | 28950 |
| 0.020662243947198143 | 28960 |
| 0.020628776657264727 | 28970 |
| 0.020595367943549214 | 28980 |
| 0.02056201769588498 | 28990 |
| 0.020528725804326964 | 29000 |
| 0.0204954921591512 | 29010 |
| 0.020462316650854333 | 29020 |
| 0.02042919917015316 | 29030 |
| 0.020396139607984157 | 29040 |
| 0.020363137855502988 | 29050 |
| 0.02033019380408412 | 29060 |
| 0.02029730734532012 | 29070 |
| 0.020264478371021535 | 29080 |
| 0.020231706773216163 | 29090 |
| 0.020198992444148686 | 29100 |
| 0.020166335276280194 | 29110 |
| 0.02013373516228772 | 29120 |
| 0.020101191995063765 | 29130 |
| 0.02006870566771586 | 29140 |
| 0.020036276073566117 | 29150 |
| 0.020003903106150713 | 29160 |
| 0.01997158665921948 | 29170 |
| 0.019939326626735466 | 29180 |
| 0.01990712290287441 | 29190 |
| 0.019874975382024356 | 29200 |
| 0.01984288395878517 | 29210 |
| 0.019810848527968085 | 29220 |
| 0.01977886898459526 | 29230 |
| 0.019746945223899304 | 29240 |
| 0.019715077141322875 | 29250 |
| 0.0196832646325182 | 29260 |
| 0.01965150759334661 | 29270 |
| 0.01961980591987813 | 29280 |
| 0.01958815950839103 | 29290 |
| 0.019556568255371345 | 29300 |
| 0.019525032057512475 | 29310 |
| 0.01949355081171477 | 29320 |
| 0.019462124415084884 | 29330 |
| 0.019430752764935662 | 29340 |
| 0.019399435758785465 | 29350 |
| 0.0193681732943578 | 29360 |
| 0.0193369652695809 | 29370 |
| 0.019305811582587238 | 29380 |
| 0.01927471213171316 | 29390 |
| 0.01924366681549839 | 29400 |
| 0.019212675532685616 | 29410 |
| 0.019181738182220087 | 29420 |
| 0.019150854663249135 | 29430 |
| 0.019120024875121773 | 29440 |
| 0.019089248717388263 | 29450 |
| 0.019058526089799677 | 29460 |
| 0.019027856892307474 | 29470 |
| 0.018997241025063092 | 29480 |
| 0.018966678388417486 | 29490 |
| 0.018936168882920733 | 29500 |
| 0.018905712409321596 | 29510 |
| 0.01887530886856711 | 29520 |
| 0.018844958161802147 | 29530 |
| 0.018814660190368992 | 29540 |
| 0.018784414855806966 | 29550 |
| 0.018754222059851937 | 29560 |
| 0.018724081704435964 | 29570 |
| 0.018693993691686898 | 29580 |
| 0.018663957923927776 | 29590 |
| 0.018633974303676703 | 29600 |
| 0.01860404273364624 | 29610 |
| 0.018574163116743026 | 29620 |
| 0.018544335356067396 | 29630 |
| 0.018514559354912953 | 29640 |
| 0.018484835016766125 | 29650 |
| 0.01845516224530583 | 29660 |
| 0.018425540944403004 | 29670 |
| 0.018395971018120218 | 29680 |
| 0.018366452370711252 | 29690 |
| 0.018336984906620727 | 29700 |
| 0.018307568530483674 | 29710 |
| 0.01827820314712511 | 29720 |
| 0.018248888661559683 | 29730 |
| 0.018219624978991246 | 29740 |
| 0.018190412004812438 | 29750 |
| 0.01816124964460431 | 29760 |
| 0.018132137804135903 | 29770 |
| 0.01810307638936389 | 29780 |
| 0.01807406530643212 | 29790 |
| 0.018045104461671266 | 29800 |
| 0.018016193761598426 | 29810 |
| 0.017987333112916684 | 29820 |
| 0.017958522422514823 | 29830 |
| 0.01792976159746672 | 29840 |
| 0.017901050545031206 | 29850 |
| 0.017872389172651527 | 29860 |
| 0.017843777387954996 | 29870 |
| 0.017815215098752567 | 29880 |
| 0.01778670221303849 | 29890 |
| 0.017758238638989916 | 29900 |
| 0.017729824284966462 | 29910 |
| 0.0177014590595099 | 29920 |
| 0.017673142871343712 | 29930 |
| 0.017644875629372735 | 29940 |
| 0.017616657242682764 | 29950 |
| 0.01758848762054017 | 29960 |
| 0.017560366672391543 | 29970 |
| 0.017532294307863263 | 29980 |
| 0.017504270436761164 | 29990 |
| 0.017476294969070133 | 30000 |
| 0.01744836781495374 | 30010 |
| 0.01742048888475385 | 30020 |
| 0.017392658088990254 | 30030 |
| 0.017364875338360296 | 30040 |
| 0.01733714054373849 | 30050 |
| 0.017309453616176144 | 30060 |
| 0.017281814466901003 | 30070 |
| 0.01725422300731686 | 30080 |
| 0.017226679149003228 | 30090 |
| 0.017199182803714803 | 30100 |
| 0.017171733883381366 | 30110 |
| 0.017144332300107198 | 30120 |
| 0.017116977966170798 | 30130 |
| 0.0170896707940245 | 30140 |
| 0.017062410696294102 | 30150 |
| 0.017035197585778518 | 30160 |
| 0.017008031375449373 | 30170 |
| 0.01698091197845068 | 30180 |
| 0.01695383930809846 | 30190 |
| 0.016926813277880384 | 30200 |
| 0.016899833801455405 | 30210 |
| 0.016872900792653384 | 30220 |
| 0.01684601416547477 | 30230 |
| 0.016819173834090193 | 30240 |
| 0.016792379712840144 | 30250 |
| 0.016765631716234596 | 30260 |
| 0.016738929758952636 | 30270 |
| 0.016712273755842152 | 30280 |
| 0.01668566362191943 | 30290 |
| 0.016659099272368822 | 30300 |
| 0.016632580622542397 | 30310 |
| 0.016606107587959575 | 30320 |
| 0.01657968008430677 | 30330 |
| 0.01655329802743707 | 30340 |
| 0.016526961333369884 | 30350 |
| 0.01650066991829047 | 30360 |
| 0.016474423698549786 | 30370 |
| 0.01644822259066403 | 30380 |
| 0.01642206651131428 | 30390 |
| 0.016395955377346196 | 30400 |
| 0.016369889105769638 | 30410 |
| 0.01634386761375833 | 30420 |
| 0.01631789081864954 | 30430 |
| 0.016291958637943693 | 30440 |
| 0.016266070989304063 | 30450 |
| 0.016240227790556415 | 30460 |
| 0.01621442895968867 | 30470 |
| 0.016188674414850546 | 30480 |
| 0.016162964074353258 | 30490 |
| 0.01613729785666914 | 30500 |
| 0.016111675680431314 | 30510 |
| 0.016086097464433374 | 30520 |
| 0.016060563127629022 | 30530 |
| 0.016035072589131748 | 30540 |
| 0.01600962576821449 | 30550 |
| 0.015984222584309305 | 30560 |
| 0.015958862957007023 | 30570 |
| 0.015933546806056912 | 30580 |
| 0.015908274051366363 | 30590 |
| 0.015883044613000604 | 30600 |
| 0.015857858411182178 | 30610 |
| 0.015832715366290856 | 30620 |
| 0.015807615398863193 | 30630 |
| 0.015782558429592173 | 30640 |
| 0.015757544379326936 | 30650 |
| 0.015732573169072433 | 30660 |
| 0.01570764471998907 | 30670 |
| 0.015682758953392443 | 30680 |
| 0.015657915790752944 | 30690 |
| 0.01563311515369548 | 30700 |
| 0.015608356963999164 | 30710 |
| 0.015583641143596933 | 30720 |
| 0.015558967614575283 | 30730 |
| 0.015534336299173914 | 30740 |
| 0.015509747119785417 | 30750 |
| 0.015485199998954974 | 30760 |
| 0.015460694859380007 | 30770 |
| 0.015436231623909873 | 30780 |
| 0.015411810215545553 | 30790 |
| 0.015387430557439323 | 30800 |
| 0.015363092572894452 | 30810 |
| 0.015338796185364866 | 30820 |
| 0.015314541318454847 | 30830 |
| 0.015290327895918722 | 30840 |
| 0.015266155841660538 | 30850 |
| 0.015242025079733776 | 30860 |
| 0.015217935534340945 | 30870 |
| 0.0151938871298334 | 30880 |
| 0.015169879790710978 | 30890 |
| 0.015145913441621662 | 30900 |
| 0.015121988007361293 | 30910 |
| 0.01509810341287326 | 30920 |
| 0.015074259583248194 | 30930 |
| 0.015050456443723662 | 30940 |
| 0.015026693919683842 | 30950 |
| 0.01500297193665924 | 30960 |
| 0.01497929042032638 | 30970 |
| 0.014955649296507483 | 30980 |
| 0.014932048491170182 | 30990 |
| 0.014908487930427204 | 31000 |
| 0.014884967540536077 | 31010 |
| 0.01486148724789883 | 31020 |
| 0.014838046979061674 | 31030 |
| 0.014814646660714722 | 31040 |
| 0.01479128621969168 | 31050 |
| 0.014767965582969542 | 31060 |
| 0.014744684677668304 | 31070 |
| 0.014721443431050646 | 31080 |
| 0.014698241770521665 | 31090 |
| 0.014675079623628547 | 31100 |
| 0.014651956918060285 | 31110 |
| 0.01462887358164742 | 31120 |
| 0.014605829542361606 | 31130 |
| 0.014582824728315518 | 31140 |
| 0.014559859067762427 | 31150 |
| 0.014536932489095942 | 31160 |
| 0.014514044920849702 | 31170 |
| 0.01449119629169711 | 31180 |
| 0.014468386530451027 | 31190 |
| 0.014445615566063476 | 31200 |
| 0.014422883327625364 | 31210 |
| 0.01440018974436619 | 31220 |
| 0.014377534745653751 | 31230 |
| 0.014354918260993867 | 31240 |
| 0.014332340220030076 | 31250 |
| 0.014309800552543361 | 31260 |
| 0.014287299188451858 | 31270 |
| 0.01426483605781057 | 31280 |
| 0.014242411090811096 | 31290 |
| 0.01422002421778132 | 31300 |
| 0.014197675369185163 | 31310 |
| 0.01417536447562226 | 31320 |
| 0.014153091467827708 | 31330 |
| 0.014130856276671785 | 31340 |
| 0.014108658833159636 | 31350 |
| 0.014086499068431036 | 31360 |
| 0.014064376913760116 | 31370 |
| 0.014042292300554956 | 31380 |
| 0.01402024516035752 | 31390 |
| 0.013998235424843217 | 31400 |
| 0.013976263025820682 | 31410 |
| 0.0139543278952315 | 31420 |
| 0.013932429965149904 | 31430 |
| 0.013910569167782527 | 31440 |
| 0.013888745435468117 | 31450 |
| 0.01386695870067726 | 31460 |
| 0.013845208896012111 | 31470 |
| 0.013823495954206117 | 31480 |
| 0.013801819808123755 | 31490 |
| 0.013780180390760243 | 31500 |
| 0.013758577635241274 | 31510 |
| 0.01373701147482277 | 31520 |
| 0.013715481842890568 | 31530 |
| 0.01369398867296019 | 31540 |
| 0.01367253189867655 | 31550 |
| 0.013651111453813699 | 31560 |
| 0.013629727272274553 | 31570 |
| 0.013608379288090623 | 31580 |
| 0.013587067435421745 | 31590 |
| 0.013565791648555838 | 31600 |
| 0.013544551861908602 | 31610 |
| 0.013523348010023285 | 31620 |
| 0.013502180027570431 | 31630 |
| 0.013481047849347502 | 31640 |
| 0.013459951410278798 | 31650 |
| 0.013438890645415069 | 31660 |
| 0.013417865489933286 | 31670 |
| 0.013396875879136374 | 31680 |
| 0.013375921748452976 | 31690 |
| 0.013355003033437148 | 31700 |
| 0.013334119669768147 | 31710 |
| 0.013313271593250133 | 31720 |
| 0.013292458739811944 | 31730 |
| 0.01327168104550681 | 31740 |
| 0.013250938446512118 | 31750 |
| 0.013230230879129142 | 31760 |
| 0.013209558279782783 | 31770 |
| 0.01318892058502133 | 31780 |
| 0.013168317731516195 | 31790 |
| 0.013147749656061651 | 31800 |
| 0.013127216295574607 | 31810 |
| 0.013106717587094304 | 31820 |
| 0.013086253467782126 | 31830 |
| 0.013065823874921279 | 31840 |
| 0.01304542874591661 | 31850 |
| 0.013025068018294297 | 31860 |
| 0.013004741629701626 | 31870 |
| 0.012984449517906744 | 31880 |
| 0.012964191620798433 | 31890 |
| 0.012943967876385732 | 31900 |
| 0.012923778222797885 | 31910 |
| 0.01290362259828397 | 31920 |
| 0.012883500941212659 | 31930 |
| 0.012863413190072004 | 31940 |
| 0.012843359283469184 | 31950 |
| 0.012823339160130235 | 31960 |
| 0.012803352758899834 | 31970 |
| 0.012783400018741033 | 31980 |
| 0.012763480878735028 | 31990 |
| 0.012743595278080918 | 32000 |
| 0.012723743156095445 | 32010 |
| 0.012703924452212778 | 32020 |
| 0.012684139105984229 | 32030 |
| 0.012664387057078065 | 32040 |
| 0.01264466824527923 | 32050 |
| 0.012624982610489107 | 32060 |
| 0.012605330092725306 | 32070 |
| 0.01258571063212138 | 32080 |
| 0.012566124168926635 | 32090 |
| 0.01254657064350585 | 32100 |
| 0.012527049996339058 | 32110 |
| 0.012507562168021328 | 32120 |
| 0.012488107099262485 | 32130 |
| 0.012468684730886935 | 32140 |
| 0.012449295003833304 | 32150 |
| 0.012429937859154387 | 32160 |
| 0.01241061323801677 | 32170 |
| 0.012391321081700655 | 32180 |
| 0.012372061331599607 | 32190 |
| 0.01235283392922034 | 32200 |
| 0.01233363881618246 | 32210 |
| 0.012314475934218243 | 32220 |
| 0.012295345225172422 | 32230 |
| 0.012276246631001925 | 32240 |
| 0.012257180093775667 | 32250 |
| 0.012238145555674311 | 32260 |
| 0.012219142958990034 | 32270 |
| 0.01220017224612631 | 32280 |
| 0.012181233359597681 | 32290 |
| 0.012162326242029502 | 32300 |
| 0.012143450836157752 | 32310 |
| 0.01212460708482879 | 32320 |
| 0.012105794930999123 | 32330 |
| 0.012087014317735173 | 32340 |
| 0.012068265188213089 | 32350 |
| 0.012049547485718475 | 32360 |
| 0.012030861153646193 | 32370 |
| 0.012012206135500136 | 32380 |
| 0.011993582374892994 | 32390 |
| 0.011974989815546075 | 32400 |
| 0.011956428401288946 | 32410 |
| 0.011937898076059413 | 32420 |
| 0.011919398783903155 | 32430 |
| 0.01190093046897355 | 32440 |
| 0.01188249307553144 | 32450 |
| 0.011864086547944927 | 32460 |
| 0.011845710830689148 | 32470 |
| 0.011827365868346047 | 32480 |
| 0.011809051605604153 | 32490 |
| 0.011790767987258394 | 32500 |
| 0.01177251495820984 | 32510 |
| 0.011754292463465503 | 32520 |
| 0.01173610044813812 | 32530 |
| 0.01171793885744594 | 32540 |
| 0.011699807636712498 | 32550 |
| 0.0116817067313664 | 32560 |
| 0.01166363608694113 | 32570 |
| 0.011645595649074797 | 32580 |
| 0.011627585363509964 | 32590 |
| 0.011609605176093388 | 32600 |
| 0.01159165503277586 | 32610 |
| 0.011573734879611936 | 32620 |
| 0.011555844662759763 | 32630 |
| 0.01153798432848087 | 32640 |
| 0.011520153823139923 | 32650 |
| 0.011502353093204569 | 32660 |
| 0.011484582085245113 | 32670 |
| 0.011466840745934476 | 32680 |
| 0.011449129022047838 | 32690 |
| 0.01143144686046252 | 32700 |
| 0.011413794208157729 | 32710 |
| 0.011396171012214353 | 32720 |
| 0.011378577219814778 | 32730 |
| 0.011361012778242661 | 32740 |
| 0.011343477634882727 | 32750 |
| 0.011325971737220563 | 32760 |
| 0.011308495032842413 | 32770 |
| 0.011291047469434972 | 32780 |
| 0.01127362899478519 | 32790 |
| 0.011256239556780047 | 32800 |
| 0.01123887910340637 | 32810 |
| 0.011221547582750605 | 32820 |
| 0.011204244942998648 | 32830 |
| 0.011186971132435613 | 32840 |
| 0.011169726099445644 | 32850 |
| 0.011152509792511705 | 32860 |
| 0.01113532216021538 | 32870 |
| 0.011118163151236682 | 32880 |
| 0.011101032714353837 | 32890 |
| 0.011083930798443099 | 32900 |
| 0.011066857352478556 | 32910 |
| 0.011049812325531863 | 32920 |
| 0.011032795666772148 | 32930 |
| 0.011015807325465754 | 32940 |
| 0.010998847250976053 | 32950 |
| 0.010981915392763225 | 32960 |
| 0.010965011700384105 | 32970 |
| 0.01094813612349195 | 32980 |
| 0.010931288611836256 | 32990 |
| 0.010914469115262563 | 33000 |
| 0.010897677583712262 | 33010 |
| 0.010880913967222388 | 33020 |
| 0.010864178215925462 | 33030 |
| 0.010847470280049171 | 33040 |
| 0.01083079010991642 | 33050 |
| 0.010814137655944883 | 33060 |
| 0.010797512868646953 | 33070 |
| 0.010780915698629507 | 33080 |
| 0.010764346096593717 | 33090 |
| 0.010747804013334868 | 33100 |
| 0.01073128939974216 | 33110 |
| 0.010714802206798511 | 33120 |
| 0.01069834238558038 | 33130 |
| 0.010681909887257571 | 33140 |
| 0.010665504663093035 | 33150 |
| 0.010649126664442692 | 33160 |
| 0.01063277584275526 | 33170 |
| 0.010616452149571977 | 33180 |
| 0.010600155536526549 | 33190 |
| 0.010583885955344874 | 33200 |
| 0.01056764335784487 | 33210 |
| 0.010551427695936293 | 33220 |
| 0.010535238921620558 | 33230 |
| 0.010519076986990547 | 33240 |
| 0.0105029418442304 | 33250 |
| 0.010486833445615379 | 33260 |
| 0.010470751743511648 | 33270 |
| 0.010454696690376084 | 33280 |
| 0.010438668238756143 | 33290 |
| 0.01042266634128954 | 33300 |
| 0.010406690950704315 | 33310 |
| 0.010390742019818393 | 33320 |
| 0.010374819501539534 | 33330 |
| 0.010358923348865134 | 33340 |
| 0.010343053514882026 | 33350 |
| 0.010327209952766337 | 33360 |
| 0.01031139261578318 | 33370 |
| 0.01029560145728672 | 33380 |
| 0.010279836430719738 | 33390 |
| 0.010264097489613598 | 33400 |
| 0.010248384587588009 | 33410 |
| 0.010232697678350887 | 33420 |
| 0.010217036715698161 | 33430 |
| 0.010201401653513523 | 33440 |
| 0.010185792445768393 | 33450 |
| 0.010170209046521635 | 33460 |
| 0.010154651409919408 | 33470 |
| 0.010139119490194998 | 33480 |
| 0.01012361324166862 | 33490 |
| 0.010108132618747274 | 33500 |
| 0.01009267757592454 | 33510 |
| 0.010077248067780426 | 33520 |
| 0.01006184404898117 | 33530 |
| 0.010046465474279082 | 33540 |
| 0.010031112298512395 | 33550 |
| 0.010015784476604964 | 33560 |
| 0.010000481963566328 | 33570 |
| 0.009985204714491316 | 33580 |
| 0.009969952684559974 | 33590 |
| 0.00995472582903738 | 33600 |
| 0.009939524103273464 | 33610 |
| 0.009924347462702881 | 33620 |
| 0.009909195862844692 | 33630 |
| 0.009894069259302448 | 33640 |
| 0.009878967607763788 | 33650 |
| 0.009863890864000363 | 33660 |
| 0.009848838983867679 | 33670 |
| 0.00983381192330489 | 33680 |
| 0.009818809638334676 | 33690 |
| 0.009803832085062976 | 33700 |
| 0.009788879219678961 | 33710 |
| 0.009773950998454769 | 33720 |
| 0.009759047377745361 | 33730 |
| 0.00974416831398836 | 33740 |
| 0.009729313763703874 | 33750 |
| 0.009714483683494344 | 33760 |
| 0.009699678030044361 | 33770 |
| 0.009684896760120514 | 33780 |
| 0.009670139830571226 | 33790 |
| 0.009655407198326589 | 33800 |
| 0.00964069882039814 | 33810 |
| 0.009626014653878794 | 33820 |
| 0.009611354655942672 | 33830 |
| 0.009596718783844852 | 33840 |
| 0.009582106994921255 | 33850 |
| 0.0095675192465885 | 33860 |
| 0.00955295549634374 | 33870 |
| 0.00953841570176442 | 33880 |
| 0.009523899820508223 | 33890 |
| 0.00950940781031291 | 33900 |
| 0.009494939628996045 | 33910 |
| 0.009480495234454924 | 33920 |
| 0.009466074584666402 | 33930 |
| 0.009451677637686744 | 33940 |
| 0.00943730435165137 | 33950 |
| 0.009422954684774852 | 33960 |
| 0.009408628595350643 | 33970 |
| 0.009394326041750953 | 33980 |
| 0.00938004698242659 | 33990 |
| 0.009365791375906795 | 34000 |
| 0.009351559180799093 | 34010 |
| 0.009337350355789127 | 34020 |
| 0.009323164859640515 | 34030 |
| 0.009309002651194664 | 34040 |
| 0.00929486368937066 | 34050 |
| 0.00928074793316509 | 34060 |
| 0.00926665534165182 | 34070 |
| 0.009252585873981945 | 34080 |
| 0.009238539489383635 | 34090 |
| 0.00922451614716187 | 34100 |
| 0.009210515806698375 | 34110 |
| 0.009196538427451441 | 34120 |
| 0.009182583968955793 | 34130 |
| 0.009168652390822353 | 34140 |
| 0.009154743652738195 | 34150 |
| 0.00914085771446639 | 34160 |
| 0.009126994535845742 | 34170 |
| 0.009113154076790734 | 34180 |
| 0.009099336297291344 | 34190 |
| 0.009085541157412913 | 34200 |
| 0.009071768617295927 | 34210 |
| 0.009058018637155973 | 34220 |
| 0.00904429117728351 | 34230 |
| 0.00903058619804374 | 34240 |
| 0.009016903659876466 | 34250 |
| 0.009003243523295935 | 34260 |
| 0.008989605748890687 | 34270 |
| 0.00897599029732341 | 34280 |
| 0.008962397129330795 | 34290 |
| 0.008948826205723374 | 34300 |
| 0.008935277487385391 | 34310 |
| 0.008921750935274666 | 34320 |
| 0.008908246510422352 | 34330 |
| 0.00889476417393292 | 34340 |
| 0.008881303886983988 | 34350 |
| 0.008867865610826075 | 34360 |
| 0.008854449306782555 | 34370 |
| 0.008841054936249466 | 34380 |
| 0.008827682460695405 | 34390 |
| 0.008814331841661291 | 34400 |
| 0.008801003040760317 | 34410 |
| 0.008787696019677825 | 34420 |
| 0.008774410740171039 | 34430 |
| 0.008761147164069016 | 34440 |
| 0.008747905253272476 | 34450 |
| 0.008734684969753673 | 34460 |
| 0.008721486275556198 | 34470 |
| 0.008708309132794915 | 34480 |
| 0.00869515350365578 | 34490 |
| 0.008682019350395684 | 34500 |
| 0.008668906635342338 | 34510 |
| 0.00865581532089412 | 34520 |
| 0.008642745369519929 | 34530 |
| 0.008629696743759057 | 34540 |
| 0.008616669406221033 | 34550 |
| 0.0086036633195855 | 34560 |
| 0.008590678446602076 | 34570 |
| 0.00857771475009016 | 34580 |
| 0.008564772192938878 | 34590 |
| 0.008551850738106877 | 34600 |
| 0.008538950348622263 | 34610 |
| 0.00852607098758236 | 34620 |
| 0.008513212618153637 | 34630 |
| 0.008500375203571577 | 34640 |
| 0.008487558707140463 | 34650 |
| 0.008474763092233356 | 34660 |
| 0.008461988322291855 | 34670 |
| 0.008449234360826063 | 34680 |
| 0.008436501171414335 | 34690 |
| 0.008423788717703225 | 34700 |
| 0.008411096963407323 | 34710 |
| 0.008398425872309077 | 34720 |
| 0.008385775408258763 | 34730 |
| 0.008373145535174249 | 34740 |
| 0.008360536217040918 | 34750 |
| 0.0083479474179115 | 34760 |
| 0.008335379101905963 | 34770 |
| 0.008322831233211357 | 34780 |
| 0.008310303776081707 | 34790 |
| 0.008297796694837847 | 34800 |
| 0.008285309953867316 | 34810 |
| 0.008272843517624211 | 34820 |
| 0.008260397350629072 | 34830 |
| 0.008247971417468683 | 34840 |
| 0.008235565682796046 | 34850 |
| 0.008223180111330155 | 34860 |
| 0.008210814667855969 | 34870 |
| 0.008198469317224153 | 34880 |
| 0.008186144024351036 | 34890 |
| 0.008173838754218468 | 34900 |
| 0.008161553471873622 | 34910 |
| 0.008149288142428985 | 34920 |
| 0.008137042731062109 | 34930 |
| 0.008124817203015607 | 34940 |
| 0.008112611523596887 | 34950 |
| 0.008100425658178107 | 34960 |
| 0.008088259572196051 | 34970 |
| 0.008076113231151918 | 34980 |
| 0.008063986600611302 | 34990 |
| 0.008051879646204014 | 35000 |
| 0.008039792333623936 | 35010 |
| 0.008027724628628934 | 35020 |
| 0.00801567649704069 | 35030 |
| 0.008003647904744608 | 35040 |
| 0.007991638817689675 | 35050 |
| 0.007979649201888333 | 35060 |
| 0.00796767902341635 | 35070 |
| 0.007955728248412713 | 35080 |
| 0.007943796843079495 | 35090 |
| 0.007931884773681666 | 35100 |
| 0.007919992006547099 | 35110 |
| 0.00790811850806632 | 35120 |
| 0.0078962642446925 | 35130 |
| 0.0078844291829412 | 35140 |
| 0.00787261328939035 | 35150 |
| 0.007860816530680097 | 35160 |
| 0.007849038873512619 | 35170 |
| 0.007837280284652116 | 35180 |
| 0.007825540730924592 | 35190 |
| 0.00781382017921782 | 35200 |
| 0.00780211859648112 | 35210 |
| 0.007790435949725296 | 35220 |
| 0.007778772206022531 | 35230 |
| 0.0077671273325061775 | 35240 |
| 0.0077555012963707575 | 35250 |
| 0.007743894064871757 | 35260 |
| 0.007732305605325533 | 35270 |
| 0.007720735885109188 | 35280 |
| 0.007709184871660456 | 35290 |
| 0.007697652532477567 | 35300 |
| 0.007686138835119152 | 35310 |
| 0.007674643747204098 | 35320 |
| 0.007663167236411445 | 35330 |
| 0.007651709270480288 | 35340 |
| 0.007640269817209566 | 35350 |
| 0.007628848844458068 | 35360 |
| 0.0076174463201442435 | 35370 |
| 0.00760606221224608 | 35380 |
| 0.007594696488801049 | 35390 |
| 0.007583349117905898 | 35400 |
| 0.007572020067716607 | 35410 |
| 0.007560709306448199 | 35420 |
| 0.00754941680237471 | 35430 |
| 0.00753814252382901 | 35440 |
| 0.007526886439202706 | 35450 |
| 0.00751564851694606 | 35460 |
| 0.007504428725567793 | 35470 |
| 0.0074932270336350495 | 35480 |
| 0.007482043409773204 | 35490 |
| 0.007470877822665832 | 35500 |
| 0.007459730241054544 | 35510 |
| 0.007448600633738872 | 35520 |
| 0.007437488969576176 | 35530 |
| 0.007426395217481509 | 35540 |
| 0.007415319346427514 | 35550 |
| 0.007404261325444306 | 35560 |
| 0.007393221123619365 | 35570 |
| 0.007382198710097417 | 35580 |
| 0.007371194054080323 | 35590 |
| 0.007360207124826978 | 35600 |
| 0.007349237891653148 | 35610 |
| 0.007338286323931435 | 35620 |
| 0.007327352391091118 | 35630 |
| 0.007316436062618029 | 35640 |
| 0.007305537308054513 | 35650 |
| 0.007294656096999214 | 35660 |
| 0.007283792399107059 | 35670 |
| 0.00727294618408904 | 35680 |
| 0.0072621174217122305 | 35690 |
| 0.007251306081799589 | 35700 |
| 0.007240512134229855 | 35710 |
| 0.0072297355489375145 | 35720 |
| 0.007218976295912573 | 35730 |
| 0.007208234345200542 | 35740 |
| 0.007197509666902246 | 35750 |
| 0.007186802231173809 | 35760 |
| 0.007176112008226479 | 35770 |
| 0.00716543896832654 | 35780 |
| 0.007154783081795202 | 35790 |
| 0.007144144319008495 | 35800 |
| 0.007133522650397153 | 35810 |
| 0.007122918046446519 | 35820 |
| 0.007112330477696421 | 35830 |
| 0.007101759914741093 | 35840 |
| 0.007091206328229031 | 35850 |
| 0.007080669688862933 | 35860 |
| 0.007070149967399511 | 35870 |
| 0.007059647134649489 | 35880 |
| 0.007049161161477432 | 35890 |
| 0.007038692018801634 | 35900 |
| 0.007028239677594082 | 35910 |
| 0.007017804108880264 | 35920 |
| 0.007007385283739117 | 35930 |
| 0.006996983173302872 | 35940 |
| 0.006986597748757026 | 35950 |
| 0.006976228981340177 | 35960 |
| 0.006965876842343931 | 35970 |
| 0.006955541303112842 | 35980 |
| 0.006945222335044235 | 35990 |
| 0.0069349199095881595 | 36000 |
| 0.0069246339982472266 | 36010 |
| 0.006914364572576585 | 36020 |
| 0.006904111604183767 | 36030 |
| 0.006893875064728592 | 36040 |
| 0.006883654925923073 | 36050 |
| 0.006873451159531304 | 36060 |
| 0.006863263737369366 | 36070 |
| 0.006853092631305226 | 36080 |
| 0.0068429378132586205 | 36090 |
| 0.006832799255200979 | 36100 |
| 0.006822676929155301 | 36110 |
| 0.0068125708071960795 | 36120 |
| 0.006802480861449134 | 36130 |
| 0.006792407064091619 | 36140 |
| 0.006782349387351825 | 36150 |
| 0.006772307803509125 | 36160 |
| 0.006762282284893899 | 36170 |
| 0.0067522728038873605 | 36180 |
| 0.006742279332921529 | 36190 |
| 0.0067323018444790505 | 36200 |
| 0.006722340311093199 | 36210 |
| 0.006712394705347708 | 36220 |
| 0.006702464999876673 | 36230 |
| 0.006692551167364515 | 36240 |
| 0.00668265318054581 | 36250 |
| 0.0066727710122051875 | 36260 |
| 0.006662904635177306 | 36270 |
| 0.006653054022346696 | 36280 |
| 0.006643219146647677 | 36290 |
| 0.006633399981064269 | 36300 |
| 0.006623596498630082 | 36310 |
| 0.006613808672428226 | 36320 |
| 0.006604036475591209 | 36330 |
| 0.006594279881300859 | 36340 |
| 0.006584538862788195 | 36350 |
| 0.006574813393333361 | 36360 |
| 0.006565103446265526 | 36370 |
| 0.006555408994962745 | 36380 |
| 0.0065457300128519335 | 36390 |
| 0.006536066473408731 | 36400 |
| 0.006526418350157404 | 36410 |
| 0.006516785616670751 | 36420 |
| 0.00650716824657006 | 36430 |
| 0.00649756621352494 | 36440 |
| 0.006487979491253221 | 36450 |
| 0.00647840805352095 | 36460 |
| 0.006468851874142224 | 36470 |
| 0.006459310926979109 | 36480 |
| 0.006449785185941546 | 36490 |
| 0.006440274624987302 | 36500 |
| 0.0064307792181218125 | 36510 |
| 0.006421298939398084 | 36520 |
| 0.006411833762916675 | 36530 |
| 0.006402383662825542 | 36540 |
| 0.006392948613319981 | 36550 |
| 0.006383528588642494 | 36560 |
| 0.006374123563082742 | 36570 |
| 0.006364733510977432 | 36580 |
| 0.006355358406710215 | 36590 |
| 0.006345998224711614 | 36600 |
| 0.006336652939458931 | 36610 |
| 0.006327322525476137 | 36620 |
| 0.006318006957333819 | 36630 |
| 0.006308706209649014 | 36640 |
| 0.006299420257085218 | 36650 |
| 0.006290149074352224 | 36660 |
| 0.006280892636206066 | 36670 |
| 0.0062716509174489034 | 36680 |
| 0.006262423892928944 | 36690 |
| 0.006253211537540399 | 36700 |
| 0.006244013826223275 | 36710 |
| 0.006234830733963415 | 36720 |
| 0.006225662235792336 | 36730 |
| 0.00621650830678716 | 36740 |
| 0.00620736892207051 | 36750 |
| 0.006198244056810477 | 36760 |
| 0.006189133686220458 | 36770 |
| 0.0061800377855590815 | 36780 |
| 0.006170956330130164 | 36790 |
| 0.006161889295282596 | 36800 |
| 0.006152836656410248 | 36810 |
| 0.006143798388951892 | 36820 |
| 0.006134774468391102 | 36830 |
| 0.006125764870256193 | 36840 |
| 0.006116769570120102 | 36850 |
| 0.0061077885436003265 | 36860 |
| 0.0060988217663588236 | 36870 |
| 0.006089869214101928 | 36880 |
| 0.006080930862580285 | 36890 |
| 0.0060720066875887 | 36900 |
| 0.006063096664966142 | 36910 |
| 0.006054200770595593 | 36920 |
| 0.006045318980404003 | 36930 |
| 0.006036451270362159 | 36940 |
| 0.0060275976164846385 | 36950 |
| 0.006018757994829747 | 36960 |
| 0.006009932381499332 | 36970 |
| 0.00600112075263881 | 36980 |
| 0.005992323084437028 | 36990 |
| 0.005983539353126186 | 37000 |
| 0.005974769534981745 | 37010 |
| 0.005966013606322398 | 37020 |
| 0.0059572715435098995 | 37030 |
| 0.005948543322949015 | 37040 |
| 0.005939828921087479 | 37050 |
| 0.005931128314415865 | 37060 |
| 0.005922441479467522 | 37070 |
| 0.005913768392818483 | 37080 |
| 0.005905109031087393 | 37090 |
| 0.005896463370935407 | 37100 |
| 0.005887831389066135 | 37110 |
| 0.005879213062225534 | 37120 |
| 0.005870608367201841 | 37130 |
| 0.005862017280825505 | 37140 |
| 0.005853439779969039 | 37150 |
| 0.005844875841547037 | 37160 |
| 0.005836325442516018 | 37170 |
| 0.005827788559874384 | 37180 |
| 0.005819265170662309 | 37190 |
| 0.005810755251961683 | 37200 |
| 0.005802258780896024 | 37210 |
| 0.0057937757346303905 | 37220 |
| 0.005785306090371305 | 37230 |
| 0.005776849825366683 | 37240 |
| 0.005768406916905734 | 37250 |
| 0.005759977342318904 | 37260 |
| 0.0057515610789777615 | 37270 |
| 0.005743158104295001 | 37280 |
| 0.00573476839572422 | 37290 |
| 0.00572639193075998 | 37300 |
| 0.005718028686937657 | 37310 |
| 0.0057096786418333705 | 37320 |
| 0.00570134177306392 | 37330 |
| 0.005693018058286689 | 37340 |
| 0.005684707475199579 | 37350 |
| 0.005676410001540931 | 37360 |
| 0.005668125615089437 | 37370 |
| 0.0056598542936640685 | 37380 |
| 0.005651596015124003 | 37390 |
| 0.005643350757368554 | 37400 |
| 0.005635118498337044 | 37410 |
| 0.005626899216008807 | 37420 |
| 0.005618692888403042 | 37430 |
| 0.00561049949357878 | 37440 |
| 0.005602319009634787 | 37450 |
| 0.005594151414709484 | 37460 |
| 0.005585996686980884 | 37470 |
| 0.005577854804666509 | 37480 |
| 0.005569725746023314 | 37490 |
| 0.005561609489347606 | 37500 |
| 0.005553506012974982 | 37510 |
| 0.005545415295280235 | 37520 |
| 0.005537337314677283 | 37530 |
| 0.005529272049619147 | 37540 |
| 0.005521219478597751 | 37550 |
| 0.005513179580143973 | 37560 |
| 0.005505152332827505 | 37570 |
| 0.005497137715256804 | 37580 |
| 0.005489135706078995 | 37590 |
| 0.005481146283979813 | 37600 |
| 0.005473169427683528 | 37610 |
| 0.005465205115952861 | 37620 |
| 0.00545725332758892 | 37630 |
| 0.0054493140414311175 | 37640 |
| 0.005441387236357107 | 37650 |
| 0.0054334728912827125 | 37660 |
| 0.005425570985161811 | 37670 |
| 0.005417681496986329 | 37680 |
| 0.005409804405786126 | 37690 |
| 0.00540193969062893 | 37700 |
| 0.005394087330620261 | 37710 |
| 0.005386247304903368 | 37720 |
| 0.005378419592659147 | 37730 |
| 0.0053706041731060765 | 37740 |
| 0.005362801025500138 | 37750 |
| 0.0053550101291347475 | 37760 |
| 0.005347231463340684 | 37770 |
| 0.0053394650074860195 | 37780 |
| 0.005331710740976029 | 37790 |
| 0.0053239686432531835 | 37800 |
| 0.0053162386937969635 | 37810 |
| 0.005308520872123892 | 37820 |
| 0.005300815157787427 | 37830 |
| 0.005293121530377875 | 37840 |
| 0.005285439969522346 | 37850 |
| 0.0052777704548846675 | 37860 |
| 0.005270112966165318 | 37870 |
| 0.005262467483101356 | 37880 |
| 0.005254833985466347 | 37890 |
| 0.005247212453070309 | 37900 |
| 0.005239602865759629 | 37910 |
| 0.005232005203416967 | 37920 |
| 0.0052244194459612455 | 37930 |
| 0.005216845573347537 | 37940 |
| 0.005209283565567015 | 37950 |
| 0.00520173340264686 | 37960 |
| 0.0051941950646502205 | 37970 |
| 0.005186668531676127 | 37980 |
| 0.005179153783859419 | 37990 |
| 0.0051716508013706945 | 38000 |
| 0.005164159564416222 | 38010 |
| 0.005156680053237883 | 38020 |
| 0.005149212248113108 | 38030 |
| 0.0051417561293547916 | 38040 |
| 0.005134311677311242 | 38050 |
| 0.005126878872366106 | 38060 |
| 0.005119457694938298 | 38070 |
| 0.0051120481254819375 | 38080 |
| 0.005104650144486283 | 38090 |
| 0.005097263732475657 | 38100 |
| 0.0050898888700093865 | 38110 |
| 0.0050825255376817325 | 38120 |
| 0.005075173716121828 | 38130 |
| 0.0050678333859936016 | 38140 |
| 0.005060504527995718 | 38150 |
| 0.00505318712286151 | 38160 |
| 0.0050458811513589275 | 38170 |
| 0.005038586594290415 | 38180 |
| 0.005031303432492929 | 38190 |
| 0.005024031646837812 | 38200 |
| 0.005016771218230748 | 38210 |
| 0.00500952212761169 | 38220 |
| 0.005002284355954803 | 38230 |
| 0.00499505788426839 | 38240 |
| 0.004987842693594816 | 38250 |
| 0.004980638765010499 | 38260 |
| 0.004973446079625764 | 38270 |
| 0.004966264618584829 | 38280 |
| 0.0049590943630657275 | 38290 |
| 0.004951935294280249 | 38300 |
| 0.004944787393473878 | 38310 |
| 0.004937650641925691 | 38320 |
| 0.004930525020948355 | 38330 |
| 0.0049234105118880255 | 38340 |
| 0.004916307096124281 | 38350 |
| 0.004909214755070076 | 38360 |
| 0.004902133470171665 | 38370 |
| 0.004895063222908538 | 38380 |
| 0.004888003994793371 | 38390 |
| 0.004880955767371944 | 38400 |
| 0.004873918522223094 | 38410 |
| 0.004866892240958643 | 38420 |
| 0.004859876905223346 | 38430 |
| 0.004852872496694789 | 38440 |
| 0.004845878997083392 | 38450 |
| 0.004838896388132295 | 38460 |
| 0.004831924651617315 | 38470 |
| 0.004824963769346881 | 38480 |
| 0.004818013723161968 | 38490 |
| 0.004811074494936047 | 38500 |
| 0.004804146066575007 | 38510 |
| 0.0047972284200171 | 38520 |
| 0.004790321537232884 | 38530 |
| 0.00478342540022516 | 38540 |
| 0.004776539991028914 | 38550 |
| 0.004769665291711219 | 38560 |
| 0.004762801284371227 | 38570 |
| 0.004755947951140108 | 38580 |
| 0.004749105274180935 | 38590 |
| 0.004742273235688666 | 38600 |
| 0.004735451817890066 | 38610 |
| 0.004728641003043665 | 38620 |
| 0.004721840773439678 | 38630 |
| 0.004715051111399949 | 38640 |
| 0.004708271999277906 | 38650 |
| 0.004701503419458476 | 38660 |
| 0.004694745354358046 | 38670 |
| 0.004687997786424406 | 38680 |
| 0.00468126069813664 | 38690 |
| 0.004674534072005146 | 38700 |
| 0.004667817890571521 | 38710 |
| 0.004661112136408516 | 38720 |
| 0.004654416792119977 | 38730 |
| 0.004647731840340788 | 38740 |
| 0.004641057263736803 | 38750 |
| 0.004634393045004808 | 38760 |
| 0.004627739166872426 | 38770 |
| 0.004621095612098116 | 38780 |
| 0.004614462363471053 | 38790 |
| 0.004607839403811099 | 38800 |
| 0.004601226715968744 | 38810 |
| 0.004594624282825057 | 38820 |
| 0.00458803208729159 | 38830 |
| 0.004581450112310371 | 38840 |
| 0.004574878340853814 | 38850 |
| 0.004568316755924671 | 38860 |
| 0.004561765340555969 | 38870 |
| 0.004555224077810962 | 38880 |
| 0.004548692950783062 | 38890 |
| 0.004542171942595791 | 38900 |
| 0.004535661036402724 | 38910 |
| 0.00452916021538742 | 38920 |
| 0.004522669462763383 | 38930 |
| 0.004516188761774 | 38940 |
| 0.004509718095692453 | 38950 |
| 0.004503257447821722 | 38960 |
| 0.004496806801494481 | 38970 |
| 0.004490366140073064 | 38980 |
| 0.004483935446949396 | 38990 |
| 0.004477514705544946 | 39000 |
| 0.0044711038993106725 | 39010 |
| 0.004464703011726953 | 39020 |
| 0.004458312026303546 | 39030 |
| 0.004451930926579524 | 39040 |
| 0.004445559696123227 | 39050 |
| 0.00443919831853221 | 39060 |
| 0.0044328467774331455 | 39070 |
| 0.004426505056481838 | 39080 |
| 0.004420173139363111 | 39090 |
| 0.004413851009790805 | 39100 |
| 0.004407538651507664 | 39110 |
| 0.0044012360482853135 | 39120 |
| 0.004394943183924203 | 39130 |
| 0.004388660042253558 | 39140 |
| 0.004382386607131311 | 39150 |
| 0.00437612286244405 | 39160 |
| 0.004369868792106972 | 39170 |
| 0.004363624380063827 | 39180 |
| 0.00435738961028686 | 39190 |
| 0.004351164466776766 | 39200 |
| 0.004344948933562604 | 39210 |
| 0.004338742994701799 | 39220 |
| 0.004332546634280043 | 39230 |
| 0.004326359836411262 | 39240 |
| 0.004320182585237551 | 39250 |
| 0.004314014864929137 | 39260 |
| 0.004307856659684306 | 39270 |
| 0.0043017079537293655 | 39280 |
| 0.004295568731318576 | 39290 |
| 0.004289438976734141 | 39300 |
| 0.004283318674286081 | 39310 |
| 0.004277207808312243 | 39320 |
| 0.0042711063631782255 | 39330 |
| 0.004265014323277328 | 39340 |
| 0.004258931673030482 | 39350 |
| 0.004252858396886233 | 39360 |
| 0.004246794479320663 | 39370 |
| 0.0042407399048373495 | 39380 |
| 0.0042346946579673115 | 39390 |
| 0.004228658723268949 | 39400 |
| 0.0042226320853280055 | 39410 |
| 0.0042166147287575045 | 39420 |
| 0.004210606638197704 | 39430 |
| 0.004204607798316052 | 39440 |
| 0.0041986181938071165 | 39450 |
| 0.0041926378093925624 | 39460 |
| 0.004186666629821051 | 39470 |
| 0.004180704639868252 | 39480 |
| 0.004174751824336755 | 39490 |
| 0.0041688081680560235 | 39500 |
| 0.004162873655882348 | 39510 |
| 0.0041569482726987895 | 39520 |
| 0.004151032003415143 | 39530 |
| 0.004145124832967872 | 39540 |
| 0.004139226746320068 | 39550 |
| 0.004133337728461393 | 39560 |
| 0.004127457764408042 | 39570 |
| 0.004121586839202666 | 39580 |
| 0.004115724937914358 | 39590 |
| 0.0041098720456385785 | 39600 |
| 0.004104028147497109 | 39610 |
| 0.004098193228638032 | 39620 |
| 0.004092367274235628 | 39630 |
| 0.004086550269490359 | 39640 |
| 0.0040807421996288265 | 39650 |
| 0.004074943049903703 | 39660 |
| 0.00406915280559369 | 39670 |
| 0.004063371452003471 | 39680 |
| 0.004057598974463664 | 39690 |
| 0.004051835358330771 | 39700 |
| 0.004046080588987127 | 39710 |
| 0.004040334651840842 | 39720 |
| 0.00403459753232578 | 39730 |
| 0.00402886921590149 | 39740 |
| 0.0040231496880531546 | 39750 |
| 0.00401743893429156 | 39760 |
| 0.004011736940153033 | 39770 |
| 0.00400604369119939 | 39780 |
| 0.004000359173017908 | 39790 |
| 0.003994683371221261 | 39800 |
| 0.003989016271447462 | 39810 |
| 0.003983357859359867 | 39820 |
| 0.003977708120647055 | 39830 |
| 0.003972067041022829 | 39840 |
| 0.003966434606226162 | 39850 |
| 0.003960810802021122 | 39860 |
| 0.003955195614196872 | 39870 |
| 0.003949589028567582 | 39880 |
| 0.003943991030972407 | 39890 |
| 0.003938401607275425 | 39900 |
| 0.003932820743365598 | 39910 |
| 0.00392724842515672 | 39920 |
| 0.003921684638587382 | 39930 |
| 0.003916129369620908 | 39940 |
| 0.003910582604245322 | 39950 |
| 0.0039050443284733 | 39960 |
| 0.00389951452834213 | 39970 |
| 0.003893993189913627 | 39980 |
| 0.003888480299274148 | 39990 |
| 0.0038829758425345073 | 40000 |